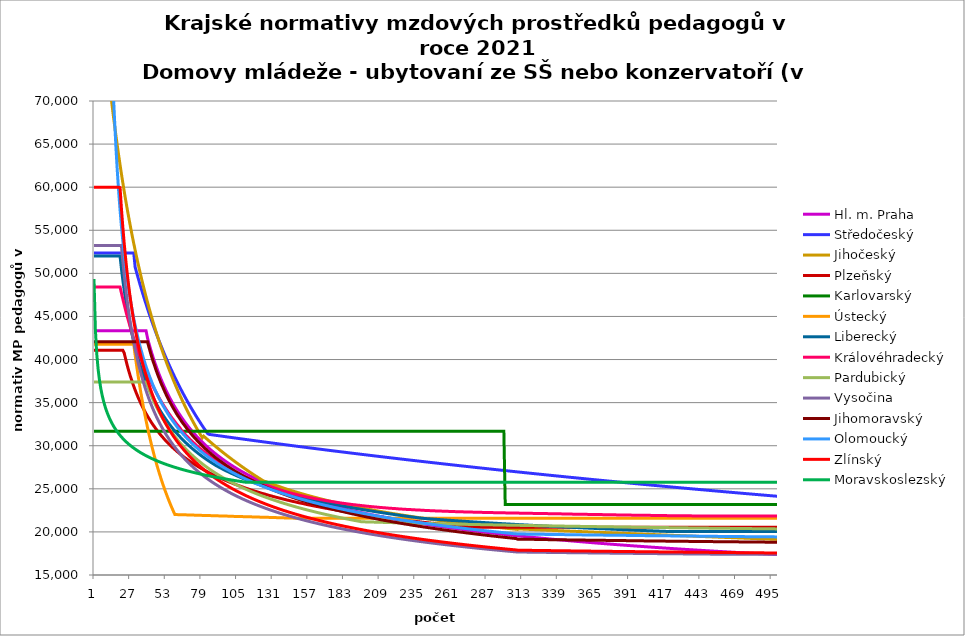
| Category | Hl. m. Praha | Středočeský | Jihočeský | Plzeňský | Karlovarský  | Ústecký   | Liberecký | Královéhradecký | Pardubický | Vysočina | Jihomoravský | Olomoucký | Zlínský | Moravskoslezský |
|---|---|---|---|---|---|---|---|---|---|---|---|---|---|---|
| 0 | 43331.092 | 52360.8 | 92683.42 | 41083 | 31680 | 41765.882 | 52000.645 | 48411.594 | 37400.308 | 53243.175 | 42066.962 | 71223.426 | 60000 | 49347.691 |
| 1 | 43331.092 | 52360.8 | 90397.734 | 41083 | 31680 | 41765.882 | 52000.645 | 48411.594 | 37400.308 | 53243.175 | 42066.962 | 71223.426 | 60000 | 43496.42 |
| 2 | 43331.092 | 52360.8 | 88222.07 | 41083 | 31680 | 41765.882 | 52000.645 | 48411.594 | 37400.308 | 53243.175 | 42066.962 | 71223.426 | 60000 | 40675.174 |
| 3 | 43331.092 | 52360.8 | 86148.671 | 41083 | 31680 | 41765.882 | 52000.645 | 48411.594 | 37400.308 | 53243.175 | 42066.962 | 71223.426 | 60000 | 38885.656 |
| 4 | 43331.092 | 52360.8 | 84170.492 | 41083 | 31680 | 41765.882 | 52000.645 | 48411.594 | 37400.308 | 53243.175 | 42066.962 | 71223.426 | 60000 | 37602.456 |
| 5 | 43331.092 | 52360.8 | 82281.121 | 41083 | 31680 | 41765.882 | 52000.645 | 48411.594 | 37400.308 | 53243.175 | 42066.962 | 71223.426 | 60000 | 36615.221 |
| 6 | 43331.092 | 52360.8 | 80474.71 | 41083 | 31680 | 41765.882 | 52000.645 | 48411.594 | 37400.308 | 53243.175 | 42066.962 | 71223.426 | 60000 | 35820.091 |
| 7 | 43331.092 | 52360.8 | 78745.911 | 41083 | 31680 | 41765.882 | 52000.645 | 48411.594 | 37400.308 | 53243.175 | 42066.962 | 71223.426 | 60000 | 35158.716 |
| 8 | 43331.092 | 52360.8 | 77089.828 | 41083 | 31680 | 41765.882 | 52000.645 | 48411.594 | 37400.308 | 53243.175 | 42066.962 | 71223.426 | 60000 | 34595.29 |
| 9 | 43331.092 | 52360.8 | 75501.967 | 41083 | 31680 | 41765.882 | 52000.645 | 48411.594 | 37400.308 | 53243.175 | 42066.962 | 71223.426 | 60000 | 34106.373 |
| 10 | 43331.092 | 52360.8 | 73978.198 | 41083 | 31680 | 41765.882 | 52000.645 | 48411.594 | 37400.308 | 53243.175 | 42066.962 | 71223.426 | 60000 | 33675.849 |
| 11 | 43331.092 | 52360.8 | 72514.718 | 41083 | 31680 | 41765.882 | 52000.645 | 48411.594 | 37400.308 | 53243.175 | 42066.962 | 71223.426 | 60000 | 33292.193 |
| 12 | 43331.092 | 52360.8 | 71108.017 | 41083 | 31680 | 41765.882 | 52000.645 | 48411.594 | 37400.308 | 53243.175 | 42066.962 | 71223.426 | 60000 | 32946.904 |
| 13 | 43331.092 | 52360.8 | 69754.854 | 41083 | 31680 | 41765.882 | 52000.645 | 48411.594 | 37400.308 | 53243.175 | 42066.962 | 71223.426 | 60000 | 32633.54 |
| 14 | 43331.092 | 52360.8 | 68452.23 | 41083 | 31680 | 41765.882 | 52000.645 | 48411.594 | 37400.308 | 53243.175 | 42066.962 | 71223.426 | 60000 | 32347.117 |
| 15 | 43331.092 | 52360.8 | 67197.365 | 41083 | 31680 | 41765.882 | 52000.645 | 48411.594 | 37400.308 | 53243.175 | 42066.962 | 67846.025 | 60000 | 32083.7 |
| 16 | 43331.092 | 52360.8 | 65987.68 | 41083 | 31680 | 41765.882 | 52000.645 | 48411.594 | 37400.308 | 53243.175 | 42066.962 | 64602.39 | 60000 | 31840.136 |
| 17 | 43331.092 | 52360.8 | 64820.779 | 41083 | 31680 | 41765.882 | 52000.645 | 48411.594 | 37400.308 | 53243.175 | 42066.962 | 61890.076 | 60000 | 31613.861 |
| 18 | 43331.092 | 52360.8 | 63694.43 | 41083 | 31680 | 41765.882 | 52000.645 | 48411.594 | 37400.308 | 53243.175 | 42066.962 | 59468.949 | 60000 | 31402.763 |
| 19 | 43331.092 | 52360.8 | 62606.557 | 41083 | 31680 | 41765.882 | 52000.645 | 48411.594 | 37400.308 | 53243.175 | 42066.962 | 57365.094 | 59952.821 | 31205.085 |
| 20 | 43331.092 | 52360.8 | 61555.221 | 41083 | 31680 | 41765.882 | 50562.156 | 47720 | 37400.308 | 53243.175 | 42066.962 | 55468.187 | 57544.722 | 31019.35 |
| 21 | 43331.092 | 52360.8 | 60538.61 | 41083 | 31680 | 41765.882 | 49262.811 | 47047.887 | 37400.308 | 51457.149 | 42066.962 | 53811.504 | 55422.183 | 30844.304 |
| 22 | 43331.092 | 52360.8 | 59555.034 | 40777.171 | 31680 | 41765.882 | 48082.133 | 46394.444 | 37400.308 | 49851.184 | 42066.962 | 52250.913 | 53535.322 | 30678.876 |
| 23 | 43331.092 | 52360.8 | 58602.908 | 40113.588 | 31680 | 41765.882 | 47003.554 | 45758.904 | 37400.308 | 48407.543 | 42066.962 | 50884.519 | 51845.368 | 30522.145 |
| 24 | 43331.092 | 52360.8 | 57680.746 | 39471.257 | 31680 | 41765.882 | 46013.519 | 45140.541 | 37400.308 | 47102.415 | 42066.962 | 49638.367 | 50321.714 | 30373.309 |
| 25 | 43331.092 | 52360.8 | 56787.156 | 38879.811 | 31680 | 41765.882 | 45100.825 | 44578.292 | 37400.308 | 45907.664 | 42066.962 | 48500.1 | 48939.865 | 30231.673 |
| 26 | 43331.092 | 52360.8 | 55920.831 | 38335.614 | 31680 | 41765.882 | 44256.123 | 44029.877 | 37400.308 | 44819.882 | 42066.962 | 47459.122 | 47679.979 | 30096.625 |
| 27 | 43331.092 | 52360.8 | 55080.542 | 37835.457 | 31680 | 41765.882 | 43471.55 | 43457.069 | 37400.308 | 43812.957 | 42066.962 | 46506.31 | 46525.803 | 29967.625 |
| 28 | 43331.092 | 52360.8 | 54265.132 | 37348.182 | 31680 | 41765.882 | 42740.438 | 42935.733 | 37400.308 | 42886.805 | 42066.962 | 45591.003 | 45463.895 | 29844.196 |
| 29 | 43331.092 | 52360.8 | 53473.512 | 36900.898 | 31680 | 41765.882 | 42057.097 | 42462.712 | 37400.308 | 42027.063 | 42066.962 | 44752.162 | 44483.034 | 29725.914 |
| 30 | 43331.092 | 50737.209 | 52704.657 | 36464.201 | 31680 | 40533.968 | 41416.635 | 41964.824 | 37400.308 | 41231.5 | 42066.962 | 43983.363 | 43573.78 | 29612.399 |
| 31 | 43331.092 | 50154.023 | 51957.597 | 36064.082 | 31680 | 39409.066 | 40814.827 | 41478.477 | 37400.308 | 40488.292 | 42066.962 | 43240.533 | 42728.127 | 29503.312 |
| 32 | 43331.092 | 49584.091 | 51231.42 | 35672.648 | 31680 | 38310.432 | 40247.996 | 41036.855 | 37400.308 | 39790.273 | 42066.962 | 42559.58 | 41939.245 | 29398.345 |
| 33 | 43331.092 | 49026.966 | 50525.262 | 35314.9 | 31680 | 37304.028 | 39712.935 | 40604.538 | 37400.308 | 39134.168 | 42066.962 | 41899.742 | 41201.264 | 29297.224 |
| 34 | 43331.092 | 48482.222 | 49838.306 | 34964.255 | 31680 | 36318.159 | 39206.825 | 40181.235 | 37400.308 | 38522.931 | 42066.962 | 41295.076 | 40509.112 | 29199.698 |
| 35 | 43331.092 | 47949.451 | 49169.779 | 34620.506 | 31680 | 35412.469 | 38727.182 | 39766.667 | 37400.308 | 37944.796 | 42066.962 | 40741.709 | 39858.384 | 29105.54 |
| 36 | 43331.092 | 47428.261 | 48518.951 | 34307.307 | 31680 | 34522.853 | 38271.808 | 39360.566 | 37400.308 | 37400.431 | 42066.962 | 40169.777 | 39245.232 | 29014.542 |
| 37 | 43331.092 | 46918.28 | 47885.126 | 34023.188 | 31680 | 33703.481 | 37838.746 | 38962.675 | 37400.308 | 36879.572 | 42066.962 | 39678.303 | 38666.283 | 28926.516 |
| 38 | 43331.092 | 46419.149 | 47267.648 | 33720.657 | 31680 | 32896.68 | 37426.253 | 38602.465 | 37400.308 | 36388.805 | 42066.962 | 39167.15 | 38118.562 | 28841.289 |
| 39 | 42519.214 | 45930.526 | 46665.892 | 33446.133 | 31680 | 32151.849 | 37032.767 | 38248.855 | 36967.585 | 35926.312 | 42066.962 | 38730.573 | 37599.438 | 28758.702 |
| 40 | 41925.242 | 45452.083 | 46079.264 | 33176.043 | 31680 | 31416.814 | 36656.888 | 37873.016 | 36544.631 | 35482.934 | 41479.127 | 38273.485 | 37106.576 | 28678.608 |
| 41 | 41361.369 | 44983.505 | 45507.203 | 32932.265 | 31680 | 30736.797 | 36297.351 | 37532.584 | 36141.099 | 35062.578 | 40907.494 | 37856.498 | 36637.891 | 28600.873 |
| 42 | 40825.212 | 44524.49 | 44949.171 | 32670.378 | 31680 | 30064.361 | 35953.016 | 37198.218 | 35755.57 | 34659.227 | 40351.402 | 37448.499 | 36191.52 | 28525.373 |
| 43 | 40314.638 | 44074.747 | 44404.659 | 32433.947 | 31680 | 29441.05 | 35622.849 | 36896.907 | 35386.766 | 34276.722 | 39843.624 | 37049.2 | 35765.793 | 28451.993 |
| 44 | 39827.733 | 43634 | 43873.182 | 32221.961 | 31680 | 28823.545 | 35305.911 | 36573.723 | 35033.531 | 33911.707 | 39381.095 | 36685.973 | 35359.204 | 28380.626 |
| 45 | 39362.773 | 43201.98 | 43354.277 | 31991.953 | 31680 | 28250.133 | 35001.347 | 36282.404 | 34694.815 | 33558.861 | 38897.297 | 36329.798 | 34970.396 | 28311.173 |
| 46 | 38918.203 | 42778.431 | 42847.502 | 31785.687 | 31680 | 27681.092 | 34708.378 | 35969.849 | 34369.665 | 33222.053 | 38456.356 | 36007.106 | 34598.138 | 28243.542 |
| 47 | 38492.614 | 42363.107 | 42352.439 | 31582.063 | 31680 | 27151.816 | 34426.288 | 35688.034 | 34057.21 | 32898.392 | 38025.3 | 35663.93 | 34241.315 | 28177.648 |
| 48 | 38084.727 | 41955.769 | 41868.685 | 31381.031 | 31680 | 26625.75 | 34154.425 | 35410.601 | 33756.656 | 32587.306 | 37633.597 | 35352.907 | 33898.913 | 28113.409 |
| 49 | 37693.379 | 41556.19 | 41395.856 | 31182.543 | 31680 | 26135.706 | 33892.187 | 35137.447 | 33467.275 | 32288.263 | 37220.69 | 35047.262 | 33570.006 | 28050.752 |
| 50 | 37317.508 | 41164.151 | 40933.589 | 31006.038 | 31680 | 25647.923 | 33639.02 | 34868.476 | 33188.399 | 32000.763 | 36873.913 | 34746.857 | 33253.748 | 27989.606 |
| 51 | 36956.146 | 40779.439 | 40481.531 | 30812.25 | 31680 | 25192.904 | 33394.416 | 34627.505 | 32919.416 | 31726.338 | 36505.457 | 34475.974 | 32949.364 | 27929.905 |
| 52 | 36608.402 | 40401.852 | 40039.349 | 30639.901 | 31680 | 24739.373 | 33157.904 | 34366.255 | 32659.759 | 31456.58 | 36144.292 | 34209.283 | 32656.145 | 27871.589 |
| 53 | 36273.462 | 40031.193 | 39606.723 | 30469.468 | 31680 | 24315.753 | 32929.046 | 34132.153 | 32408.907 | 31199.107 | 35817.195 | 33946.685 | 32373.436 | 27814.599 |
| 54 | 35950.577 | 39667.273 | 39183.345 | 30319.557 | 31680 | 23892.989 | 32707.44 | 33878.296 | 32166.379 | 30951.526 | 35495.964 | 33688.089 | 32100.636 | 27758.881 |
| 55 | 35639.055 | 39309.91 | 38768.924 | 30152.661 | 31680 | 23497.628 | 32492.711 | 33650.772 | 31931.727 | 30709.717 | 35180.444 | 33433.402 | 31837.188 | 27704.384 |
| 56 | 35338.259 | 38958.929 | 38363.177 | 29987.591 | 31680 | 23102.603 | 32284.51 | 33426.284 | 31704.538 | 30479.04 | 34896.106 | 33205.188 | 31582.58 | 27651.059 |
| 57 | 35047.6 | 38614.159 | 37965.835 | 29842.373 | 31680 | 22732.764 | 32082.513 | 33204.771 | 31484.427 | 30251.804 | 34591.114 | 32980.068 | 31336.336 | 27598.862 |
| 58 | 34766.531 | 38275.439 | 37576.639 | 29698.554 | 31680 | 22362.835 | 31886.417 | 33007.905 | 31271.037 | 30035.1 | 34316.185 | 32757.98 | 31098.015 | 27547.748 |
| 59 | 34494.547 | 37942.609 | 37195.342 | 29556.115 | 31680 | 22016.124 | 31695.94 | 32791.885 | 31064.036 | 29821.479 | 34045.591 | 32538.863 | 30867.208 | 27497.678 |
| 60 | 34231.179 | 37615.517 | 36821.705 | 29415.036 | 31680 | 22016.124 | 31510.818 | 32578.674 | 30863.111 | 29617.848 | 33779.232 | 32322.658 | 30643.533 | 27448.612 |
| 61 | 33975.987 | 37294.017 | 36455.5 | 29275.297 | 31680 | 22004.752 | 31330.804 | 32389.14 | 30667.974 | 29416.978 | 33517.008 | 32109.307 | 30426.635 | 27400.515 |
| 62 | 33728.566 | 36977.966 | 36096.508 | 29154.11 | 31680 | 22004.752 | 31155.667 | 32201.799 | 30478.353 | 29223.907 | 33282.13 | 31919.685 | 30216.185 | 27353.352 |
| 63 | 33488.535 | 36667.227 | 35744.517 | 29016.833 | 31680 | 21993.392 | 30985.19 | 31996.169 | 30293.994 | 29038.379 | 33050.522 | 31732.29 | 30011.873 | 27307.09 |
| 64 | 33255.54 | 36361.667 | 35399.324 | 28897.773 | 31680 | 21993.392 | 30819.169 | 31732.742 | 30114.659 | 28853.538 | 32799.448 | 31547.082 | 29813.409 | 27261.698 |
| 65 | 33029.248 | 36061.157 | 35060.735 | 28762.894 | 31680 | 21982.043 | 30657.412 | 31572.779 | 29940.126 | 28675.938 | 32574.486 | 31364.023 | 29620.524 | 27217.146 |
| 66 | 32809.351 | 35765.574 | 34728.562 | 28645.904 | 31680 | 21982.043 | 30499.738 | 31394.737 | 29770.183 | 28505.354 | 32374.642 | 31183.077 | 29432.964 | 27173.406 |
| 67 | 32595.556 | 35474.797 | 34402.623 | 28529.861 | 31680 | 21982.043 | 30345.979 | 31218.692 | 29604.634 | 28335.192 | 32155.45 | 31004.207 | 29250.492 | 27130.451 |
| 68 | 32387.59 | 35188.71 | 34082.746 | 28414.755 | 31680 | 21970.707 | 30195.974 | 31063.856 | 29443.293 | 28171.781 | 31939.206 | 30827.376 | 29072.882 | 27088.257 |
| 69 | 32185.197 | 34907.2 | 33768.763 | 28300.574 | 31680 | 21970.707 | 30049.571 | 30910.549 | 29285.986 | 28013.362 | 31747.059 | 30671.879 | 28899.927 | 27046.797 |
| 70 | 31988.136 | 34630.159 | 33460.512 | 28187.307 | 31680 | 21959.381 | 29906.627 | 30739.877 | 29132.546 | 27856.716 | 31557.209 | 30517.942 | 28731.427 | 27006.05 |
| 71 | 31796.179 | 34357.48 | 33157.837 | 28090.94 | 31680 | 21959.381 | 29767.009 | 30589.744 | 28982.819 | 27706.388 | 31348.911 | 30346.6 | 28567.197 | 26965.992 |
| 72 | 31609.114 | 34089.062 | 32860.589 | 27979.342 | 31680 | 21948.068 | 29630.587 | 30441.069 | 28836.657 | 27557.673 | 31163.78 | 30195.903 | 28407.061 | 26926.604 |
| 73 | 31426.737 | 33824.806 | 32568.624 | 27868.626 | 31680 | 21948.068 | 29497.241 | 30293.833 | 28693.92 | 27413.534 | 30980.822 | 30046.695 | 28250.853 | 26887.863 |
| 74 | 31248.859 | 33564.615 | 32281.8 | 27774.423 | 31680 | 21936.766 | 29366.855 | 30148.014 | 28554.478 | 27272.372 | 30819.987 | 29898.955 | 28098.416 | 26849.752 |
| 75 | 31075.301 | 33308.397 | 31999.985 | 27680.853 | 31680 | 21936.766 | 29239.322 | 30003.593 | 28418.205 | 27134.121 | 30641.032 | 29770.869 | 27949.602 | 26812.252 |
| 76 | 30905.89 | 33056.061 | 31723.048 | 27572.483 | 31680 | 21936.766 | 29114.537 | 29860.548 | 28284.982 | 26998.712 | 30464.144 | 29625.822 | 27804.271 | 26775.344 |
| 77 | 30740.468 | 32807.519 | 31450.862 | 27480.268 | 31680 | 21925.476 | 28992.402 | 29736.499 | 28154.698 | 26868.952 | 30308.615 | 29482.182 | 27662.289 | 26739.012 |
| 78 | 30578.881 | 32562.687 | 31183.308 | 27388.667 | 31680 | 21925.476 | 28872.825 | 29595.983 | 28027.245 | 26739.013 | 30154.667 | 29357.634 | 27523.532 | 26703.24 |
| 79 | 30420.985 | 32321.481 | 30920.268 | 27297.674 | 31680 | 21914.198 | 28755.715 | 29474.118 | 27902.523 | 26614.546 | 29983.333 | 29216.577 | 27387.88 | 26668.011 |
| 80 | 30266.643 | 32083.824 | 31113.726 | 27207.285 | 31680 | 21914.198 | 28640.99 | 29336.066 | 27780.435 | 26491.234 | 29832.663 | 29094.258 | 27255.218 | 26633.311 |
| 81 | 30115.724 | 31849.635 | 30971.326 | 27117.492 | 31680 | 21902.931 | 28528.566 | 29216.327 | 27660.889 | 26370.44 | 29683.5 | 28972.96 | 27125.44 | 26599.125 |
| 82 | 29968.105 | 31618.841 | 30830.223 | 27043.116 | 31680 | 21902.931 | 28418.369 | 29080.673 | 27543.799 | 26252.113 | 29535.821 | 28852.669 | 26998.443 | 26565.44 |
| 83 | 29823.669 | 31391.367 | 30690.401 | 26954.401 | 31680 | 21902.931 | 28310.325 | 28963.006 | 27429.08 | 26137.558 | 29389.604 | 28733.373 | 26874.13 | 26532.242 |
| 84 | 29682.303 | 31316.268 | 30551.84 | 26866.267 | 31680 | 21891.675 | 28204.363 | 28846.287 | 27316.654 | 26023.999 | 29262.847 | 28615.059 | 26752.407 | 26499.518 |
| 85 | 29543.901 | 31293.808 | 30414.526 | 26793.261 | 31680 | 21891.675 | 28100.417 | 28730.505 | 27206.444 | 25912.757 | 29119.313 | 28497.715 | 26633.186 | 26467.256 |
| 86 | 29408.362 | 31271.381 | 30278.44 | 26706.176 | 31680 | 21880.431 | 27998.423 | 28615.648 | 27098.379 | 25805.108 | 28977.181 | 28381.33 | 26516.383 | 26435.444 |
| 87 | 29275.588 | 31248.985 | 30143.566 | 26634.036 | 31680 | 21880.431 | 27898.32 | 28501.706 | 26992.39 | 25699.663 | 28853.949 | 28265.892 | 26401.918 | 26404.071 |
| 88 | 29145.489 | 31226.622 | 30009.889 | 26547.981 | 31680 | 21869.199 | 27800.049 | 28388.669 | 26888.41 | 25593.774 | 28714.389 | 28167.69 | 26289.714 | 26373.125 |
| 89 | 29017.975 | 31204.291 | 29877.392 | 26476.692 | 31680 | 21869.199 | 27703.554 | 28292.49 | 26786.377 | 25491.337 | 28593.377 | 28053.979 | 26179.697 | 26342.597 |
| 90 | 28892.962 | 31181.991 | 29746.06 | 26391.649 | 31680 | 21869.199 | 27615.404 | 28181.102 | 26686.23 | 25390.997 | 28473.381 | 27941.183 | 26071.798 | 26312.475 |
| 91 | 28770.371 | 31159.724 | 29615.877 | 26321.196 | 31680 | 21857.978 | 27528.768 | 28070.588 | 26587.912 | 25292.716 | 28354.388 | 27845.22 | 25965.949 | 26282.75 |
| 92 | 28650.125 | 31137.488 | 29486.829 | 26251.118 | 31680 | 21857.978 | 27443.601 | 27976.549 | 26491.366 | 25195.193 | 28236.385 | 27749.914 | 25862.087 | 26253.412 |
| 93 | 28532.15 | 31115.284 | 29358.901 | 26181.413 | 31680 | 21846.769 | 27359.862 | 27867.631 | 26396.541 | 25099.671 | 28119.361 | 27639.545 | 25760.15 | 26224.453 |
| 94 | 28416.375 | 31093.112 | 29232.078 | 26112.076 | 31680 | 21846.769 | 27277.51 | 27774.945 | 26303.385 | 25008.599 | 28003.302 | 27545.64 | 25660.08 | 26195.863 |
| 95 | 28302.734 | 31070.971 | 29106.345 | 26043.106 | 31680 | 21835.572 | 27196.508 | 27667.587 | 26211.849 | 24915.718 | 27888.197 | 27452.37 | 25561.82 | 26167.633 |
| 96 | 28191.162 | 31048.861 | 28981.69 | 25974.499 | 31680 | 21835.572 | 27116.817 | 27576.225 | 26121.887 | 24825.973 | 27774.035 | 27359.73 | 25465.316 | 26139.756 |
| 97 | 28081.597 | 31026.784 | 28858.098 | 25906.253 | 31680 | 21835.572 | 27038.402 | 27485.464 | 26033.454 | 24736.873 | 27660.804 | 27267.713 | 25370.517 | 26112.224 |
| 98 | 27973.98 | 31004.737 | 28735.556 | 25838.365 | 31680 | 21824.385 | 26961.228 | 27395.298 | 25946.506 | 24649.618 | 27564.481 | 27176.313 | 25277.373 | 26085.028 |
| 99 | 27868.253 | 30982.722 | 28614.05 | 25770.831 | 31680 | 21824.385 | 26885.263 | 27305.722 | 25861.002 | 24564.175 | 27452.948 | 27085.523 | 25185.836 | 26058.161 |
| 100 | 27764.364 | 30960.738 | 28493.567 | 25717.058 | 31680 | 21813.21 | 26810.474 | 27216.73 | 25776.902 | 24479.323 | 27342.314 | 26995.339 | 25095.861 | 26031.615 |
| 101 | 27662.258 | 30938.785 | 28374.095 | 25650.156 | 31680 | 21813.21 | 26736.831 | 27128.316 | 25694.168 | 24397.42 | 27248.193 | 26905.752 | 25007.403 | 26005.385 |
| 102 | 27561.886 | 30916.863 | 28255.62 | 25583.601 | 31680 | 21802.047 | 26664.304 | 27040.475 | 25612.763 | 24314.889 | 27154.717 | 26831.55 | 24920.421 | 25979.462 |
| 103 | 27463.198 | 30894.973 | 28138.131 | 25530.606 | 31680 | 21802.047 | 26592.865 | 26953.201 | 25532.652 | 24236.416 | 27046.469 | 26743.046 | 24834.874 | 25953.841 |
| 104 | 27366.15 | 30873.113 | 28021.614 | 25464.669 | 31680 | 21790.895 | 26522.485 | 26866.488 | 25453.799 | 24157.288 | 26954.37 | 26655.123 | 24750.722 | 25928.515 |
| 105 | 27270.695 | 30851.284 | 27906.059 | 25399.073 | 31680 | 21790.895 | 26453.139 | 26794.652 | 25376.172 | 24079.828 | 26862.896 | 26582.295 | 24667.928 | 25903.477 |
| 106 | 27176.79 | 30829.487 | 27791.452 | 25346.838 | 31680 | 21790.895 | 26384.801 | 26708.955 | 25299.74 | 24005.153 | 26772.041 | 26495.425 | 24586.456 | 25878.723 |
| 107 | 27084.395 | 30807.719 | 27677.784 | 25294.818 | 31680 | 21779.755 | 26317.445 | 26637.959 | 25224.472 | 23928.663 | 26666.816 | 26423.466 | 24506.271 | 25854.245 |
| 108 | 26993.469 | 30785.983 | 27565.041 | 25230.092 | 31680 | 21779.755 | 26251.049 | 26553.259 | 25150.337 | 23853.79 | 26577.28 | 26337.629 | 24427.338 | 25830.038 |
| 109 | 26903.973 | 30764.277 | 27453.213 | 25178.55 | 31680 | 21768.625 | 26185.589 | 26483.087 | 25077.308 | 23781.633 | 26488.344 | 26266.523 | 24349.627 | 25806.097 |
| 110 | 26815.871 | 30742.602 | 27342.288 | 25114.417 | 31680 | 21768.625 | 26121.042 | 26399.368 | 25005.358 | 23709.91 | 26400 | 26181.701 | 24273.105 | 25782.417 |
| 111 | 26729.126 | 30720.958 | 27232.257 | 25063.345 | 31680 | 21757.508 | 26057.388 | 26330.005 | 24934.458 | 23639.729 | 26326.829 | 26111.433 | 24197.743 | 25758.991 |
| 112 | 26643.705 | 30699.343 | 27123.107 | 25012.481 | 31680 | 21757.508 | 25994.604 | 26261.006 | 24864.585 | 23571.067 | 26239.558 | 26041.542 | 24123.511 | 25757.576 |
| 113 | 26559.573 | 30677.76 | 27014.829 | 24961.823 | 31680 | 21757.508 | 25932.672 | 26192.368 | 24795.712 | 23501.705 | 26152.863 | 25972.023 | 24050.381 | 25757.576 |
| 114 | 26476.699 | 30656.206 | 26907.412 | 24898.788 | 31680 | 21746.401 | 25871.571 | 26124.088 | 24727.817 | 23433.841 | 26066.74 | 25902.875 | 23978.325 | 25757.576 |
| 115 | 26395.051 | 30634.683 | 26800.846 | 24848.589 | 31680 | 21746.401 | 25811.283 | 26056.162 | 24660.875 | 23367.453 | 25995.402 | 25834.095 | 23907.319 | 25757.576 |
| 116 | 26314.599 | 30613.19 | 26695.121 | 24798.592 | 31680 | 21735.306 | 25751.789 | 25988.589 | 24594.865 | 23302.519 | 25910.311 | 25752.038 | 23837.336 | 25757.576 |
| 117 | 26235.315 | 30591.727 | 26590.226 | 24748.795 | 31680 | 21735.306 | 25693.071 | 25921.366 | 24529.765 | 23236.872 | 25825.775 | 25684.055 | 23768.352 | 25757.576 |
| 118 | 26157.171 | 30570.294 | 26486.153 | 24699.198 | 31680 | 21724.222 | 25635.113 | 25854.489 | 24465.553 | 23173.729 | 25755.748 | 25616.43 | 23700.343 | 25757.576 |
| 119 | 26080.138 | 30548.891 | 26382.891 | 24649.8 | 31680 | 21724.222 | 25577.897 | 25787.957 | 24402.21 | 23109.866 | 25672.216 | 25562.585 | 23633.287 | 25757.576 |
| 120 | 26004.192 | 30527.519 | 26280.431 | 24600.599 | 31680 | 21724.222 | 25521.408 | 25721.766 | 24339.716 | 23048.465 | 25603.019 | 25495.597 | 23567.161 | 25757.576 |
| 121 | 25929.306 | 30506.176 | 26178.764 | 24551.594 | 31680 | 21713.15 | 25465.63 | 25655.914 | 24278.051 | 22986.34 | 25534.194 | 25428.96 | 23501.943 | 25757.576 |
| 122 | 25855.457 | 30484.863 | 26077.881 | 24502.783 | 31680 | 21713.15 | 25410.547 | 25603.475 | 24217.198 | 22926.638 | 25452.09 | 25362.669 | 23437.614 | 25757.576 |
| 123 | 25782.62 | 30463.579 | 25977.772 | 24454.167 | 31680 | 21702.089 | 25356.145 | 25538.226 | 24157.138 | 22867.245 | 25384.073 | 25296.724 | 23374.152 | 25757.576 |
| 124 | 25710.772 | 30442.326 | 25878.428 | 24417.831 | 31680 | 21702.089 | 25302.41 | 25486.267 | 24097.854 | 22808.16 | 25316.418 | 25244.214 | 23311.539 | 25757.576 |
| 125 | 25639.892 | 30421.102 | 25858.002 | 24369.55 | 31680 | 21691.039 | 25249.328 | 25421.613 | 24039.329 | 22749.378 | 25235.707 | 25178.882 | 23249.755 | 25757.576 |
| 126 | 25569.956 | 30399.907 | 25795.848 | 24321.46 | 31680 | 21691.039 | 25196.885 | 25370.127 | 23981.547 | 22691.923 | 25168.839 | 25113.887 | 23188.782 | 25757.576 |
| 127 | 25500.946 | 30378.742 | 25734.477 | 24273.56 | 31680 | 21691.039 | 25145.068 | 25306.061 | 23924.492 | 22635.775 | 25102.326 | 25062.133 | 23128.603 | 25757.576 |
| 128 | 25432.839 | 30357.607 | 25673.871 | 24225.848 | 31680 | 21680 | 25093.864 | 25255.04 | 23868.149 | 22579.904 | 25036.162 | 24997.739 | 23069.2 | 25757.576 |
| 129 | 25365.617 | 30336.501 | 25614.015 | 24190.186 | 31680 | 21680 | 25043.262 | 25204.225 | 23812.503 | 22525.317 | 24970.347 | 24933.675 | 23010.557 | 25757.576 |
| 130 | 25299.261 | 30315.424 | 25554.893 | 24142.801 | 31680 | 21668.973 | 24993.248 | 25153.614 | 23757.539 | 22469.989 | 24904.877 | 24882.66 | 22952.657 | 25757.576 |
| 131 | 25233.752 | 30294.376 | 25496.489 | 24095.601 | 31680 | 21668.973 | 24943.813 | 25103.206 | 23703.243 | 22416.93 | 24839.749 | 24819.184 | 22895.485 | 25757.576 |
| 132 | 25169.071 | 30273.358 | 25438.79 | 24060.322 | 31680 | 21657.956 | 24894.943 | 25040.48 | 23649.602 | 22363.127 | 24774.961 | 24768.635 | 22839.025 | 25757.576 |
| 133 | 25105.202 | 30252.369 | 25381.78 | 24013.444 | 31680 | 21657.956 | 24846.628 | 24990.524 | 23596.602 | 22310.571 | 24710.51 | 24718.293 | 22783.262 | 25757.576 |
| 134 | 25042.128 | 30231.409 | 25325.447 | 23978.405 | 31680 | 21646.951 | 24798.858 | 24940.767 | 23544.23 | 22258.261 | 24646.393 | 24655.651 | 22728.183 | 25757.576 |
| 135 | 24979.832 | 30210.478 | 25269.776 | 23931.845 | 31680 | 21646.951 | 24751.621 | 24891.207 | 23492.475 | 22207.177 | 24582.609 | 24605.766 | 22673.773 | 25757.576 |
| 136 | 24918.298 | 30189.576 | 25214.754 | 23897.043 | 31680 | 21646.951 | 24704.908 | 24854.167 | 23441.323 | 22156.326 | 24519.153 | 24556.083 | 22620.019 | 25757.576 |
| 137 | 24857.51 | 30168.702 | 25160.369 | 23850.798 | 31680 | 21635.957 | 24658.709 | 24804.95 | 23390.763 | 22106.678 | 24468.624 | 24494.26 | 22566.907 | 25757.576 |
| 138 | 24797.455 | 30147.858 | 25106.609 | 23816.232 | 31680 | 21635.957 | 24613.014 | 24755.929 | 23340.783 | 22058.22 | 24405.755 | 24445.025 | 22514.425 | 25757.576 |
| 139 | 24738.116 | 30127.043 | 25053.46 | 23770.299 | 31680 | 21624.975 | 24567.814 | 24707.101 | 23291.373 | 22009.011 | 24343.209 | 24395.988 | 22462.56 | 25757.576 |
| 140 | 24679.48 | 30106.256 | 25000.912 | 23735.965 | 31680 | 21624.975 | 24523.1 | 24658.465 | 23242.521 | 21960.979 | 24293.402 | 24347.147 | 22411.3 | 25757.576 |
| 141 | 24621.532 | 30085.498 | 24948.953 | 23690.341 | 31680 | 21614.003 | 24478.862 | 24622.113 | 23194.216 | 21913.157 | 24231.429 | 24286.37 | 22360.633 | 25757.576 |
| 142 | 24564.26 | 30064.768 | 24897.572 | 23656.238 | 31680 | 21614.003 | 24435.093 | 24573.811 | 23146.449 | 21865.543 | 24169.771 | 24237.967 | 22310.548 | 25757.576 |
| 143 | 24507.65 | 30044.067 | 24846.758 | 23622.233 | 31680 | 21614.003 | 24391.783 | 24537.708 | 23099.208 | 21819.081 | 24120.67 | 24189.756 | 22261.034 | 25757.576 |
| 144 | 24451.689 | 30023.394 | 24796.5 | 23577.044 | 31680 | 21603.043 | 24348.924 | 24489.736 | 23052.486 | 21772.816 | 24059.574 | 24141.737 | 22212.079 | 25757.576 |
| 145 | 24396.366 | 30002.75 | 24746.789 | 23543.266 | 31680 | 21603.043 | 24306.509 | 24453.88 | 23006.271 | 21727.685 | 24010.92 | 24093.908 | 22163.673 | 25757.576 |
| 146 | 24341.667 | 29982.135 | 24697.614 | 23509.585 | 31680 | 21592.093 | 24264.529 | 24406.235 | 22960.554 | 21681.806 | 23950.378 | 24046.268 | 22115.806 | 25757.576 |
| 147 | 24287.581 | 29961.547 | 24648.965 | 23476 | 31680 | 21592.093 | 24222.978 | 24370.623 | 22915.327 | 21637.052 | 23902.164 | 23998.816 | 22068.468 | 25757.576 |
| 148 | 24234.097 | 29940.988 | 24600.833 | 23431.369 | 31680 | 21581.155 | 24181.846 | 24335.114 | 22870.58 | 21592.481 | 23842.169 | 23951.551 | 22021.649 | 25757.576 |
| 149 | 24181.204 | 29920.457 | 24553.209 | 23398.007 | 31680 | 21581.155 | 24141.128 | 24287.93 | 22826.306 | 21549.017 | 23794.389 | 23904.472 | 21975.339 | 25757.576 |
| 150 | 24128.89 | 29899.954 | 24506.084 | 23364.739 | 31680 | 21581.155 | 24100.816 | 24252.662 | 22782.495 | 21505.727 | 23746.8 | 23857.577 | 21929.53 | 25757.576 |
| 151 | 24077.145 | 29879.48 | 24459.448 | 23331.566 | 31680 | 21581.155 | 24060.903 | 24217.496 | 22739.139 | 21461.696 | 23687.581 | 23810.866 | 21884.211 | 25757.576 |
| 152 | 24025.958 | 29859.033 | 24413.294 | 23298.488 | 31680 | 21581.155 | 24021.383 | 24182.432 | 22696.231 | 21419.668 | 23640.418 | 23764.338 | 21839.375 | 25757.576 |
| 153 | 23975.32 | 29838.614 | 24367.612 | 23265.503 | 31680 | 21581.155 | 23982.248 | 24147.47 | 22653.762 | 21378.713 | 23593.443 | 23729.561 | 21795.012 | 25757.576 |
| 154 | 23925.221 | 29818.223 | 24322.396 | 23232.611 | 31680 | 21581.155 | 23943.493 | 24101.01 | 22611.726 | 21336.104 | 23546.653 | 23683.35 | 21751.115 | 25757.576 |
| 155 | 23875.651 | 29797.86 | 24277.635 | 23188.899 | 31680 | 21581.155 | 23905.111 | 24066.282 | 22570.114 | 21295.467 | 23488.427 | 23637.318 | 21707.674 | 25757.576 |
| 156 | 23826.601 | 29777.525 | 24233.324 | 23156.224 | 31680 | 21581.155 | 23867.096 | 24031.655 | 22528.919 | 21254.985 | 23442.053 | 23591.465 | 21664.683 | 25757.576 |
| 157 | 23778.061 | 29757.218 | 24189.454 | 23123.64 | 31680 | 21581.155 | 23829.441 | 24008.625 | 22488.135 | 21215.551 | 23395.862 | 23557.191 | 21622.133 | 25757.576 |
| 158 | 23730.023 | 29736.938 | 24146.018 | 23091.148 | 31680 | 21581.155 | 23792.142 | 23974.163 | 22447.753 | 21175.371 | 23349.853 | 23511.648 | 21580.017 | 25757.576 |
| 159 | 23682.478 | 29716.686 | 24103.008 | 23058.746 | 31680 | 21581.155 | 23755.192 | 23939.799 | 22407.769 | 21136.232 | 23304.024 | 23466.281 | 21538.327 | 25757.576 |
| 160 | 23635.418 | 29696.461 | 24060.418 | 23026.436 | 31680 | 21581.155 | 23718.586 | 23905.534 | 22368.174 | 21097.237 | 23258.374 | 23421.088 | 21497.056 | 25757.576 |
| 161 | 23588.834 | 29676.264 | 24018.241 | 22994.216 | 31680 | 21581.155 | 23682.318 | 23871.367 | 22328.963 | 21059.267 | 23212.903 | 23387.308 | 21456.197 | 25757.576 |
| 162 | 23542.718 | 29656.094 | 23976.469 | 22962.087 | 31680 | 21581.155 | 23646.383 | 23837.298 | 22290.129 | 21019.677 | 23167.61 | 23342.418 | 21415.743 | 25757.576 |
| 163 | 23497.063 | 29635.952 | 23935.096 | 22940.717 | 31680 | 21581.155 | 23610.776 | 23814.639 | 22251.667 | 20981.11 | 23122.493 | 23308.864 | 21375.688 | 25757.576 |
| 164 | 23451.86 | 29615.837 | 23894.117 | 22908.736 | 31680 | 21581.155 | 23575.491 | 23780.731 | 22213.569 | 20943.556 | 23077.551 | 23264.275 | 21336.024 | 25757.576 |
| 165 | 23407.102 | 29595.749 | 23853.523 | 22876.845 | 31680 | 21581.155 | 23540.524 | 23746.919 | 22175.831 | 20907.875 | 23032.784 | 23219.857 | 21296.745 | 25757.576 |
| 166 | 23362.783 | 29575.689 | 23813.31 | 22845.042 | 31680 | 21581.155 | 23505.87 | 23724.432 | 22138.446 | 20870.582 | 22988.19 | 23186.654 | 21257.845 | 25757.576 |
| 167 | 23318.894 | 29555.656 | 23773.472 | 22813.327 | 31680 | 21581.155 | 23471.523 | 23690.78 | 22101.409 | 20834.286 | 22943.768 | 23142.531 | 21219.319 | 25757.576 |
| 168 | 23275.428 | 29535.65 | 23734.001 | 22781.701 | 31680 | 21581.155 | 23437.48 | 23668.399 | 22064.715 | 20798.115 | 22899.518 | 23109.549 | 21181.158 | 25757.576 |
| 169 | 23232.379 | 29515.671 | 23694.893 | 22750.162 | 31680 | 21581.155 | 23403.735 | 23634.906 | 22028.357 | 20762.07 | 22855.438 | 23065.718 | 21143.359 | 25757.576 |
| 170 | 23189.741 | 29495.719 | 23656.142 | 22729.184 | 31680 | 21581.155 | 23370.284 | 23612.63 | 21992.332 | 20726.149 | 22811.527 | 23032.955 | 21105.915 | 25757.576 |
| 171 | 23147.505 | 29475.794 | 23617.742 | 22697.79 | 31680 | 21581.155 | 23337.123 | 23579.294 | 21956.633 | 20691.204 | 22767.785 | 23000.284 | 21068.821 | 25757.576 |
| 172 | 23105.667 | 29455.896 | 23579.689 | 22666.483 | 31680 | 21581.155 | 23304.247 | 23557.123 | 21921.255 | 20656.376 | 22724.211 | 22956.866 | 21032.071 | 25757.576 |
| 173 | 23064.22 | 29436.024 | 23541.976 | 22635.262 | 31680 | 21581.155 | 23271.653 | 23534.993 | 21886.195 | 20622.51 | 22691.639 | 22924.411 | 20995.659 | 25757.576 |
| 174 | 23023.157 | 29416.18 | 23504.598 | 22604.127 | 31680 | 21581.155 | 23239.335 | 23501.876 | 21851.446 | 20587.913 | 22648.355 | 22881.279 | 20959.581 | 25757.576 |
| 175 | 22982.473 | 29396.362 | 23467.551 | 22583.417 | 31680 | 21581.155 | 23207.291 | 23479.85 | 21817.005 | 20554.271 | 22605.236 | 22849.037 | 20923.831 | 25757.576 |
| 176 | 22942.162 | 29376.571 | 23430.83 | 22552.425 | 31680 | 21581.155 | 23175.516 | 23457.865 | 21782.866 | 20519.902 | 22562.28 | 22816.886 | 20888.404 | 25757.576 |
| 177 | 22902.218 | 29356.806 | 23394.429 | 22521.517 | 31680 | 21581.155 | 23144.005 | 23435.921 | 21749.026 | 20487.316 | 22530.171 | 22774.157 | 20853.296 | 25757.576 |
| 178 | 22862.635 | 29337.069 | 23358.344 | 22500.958 | 31680 | 21581.155 | 23112.757 | 23403.083 | 21715.479 | 20454.002 | 22487.5 | 22742.216 | 20818.501 | 25757.576 |
| 179 | 22823.409 | 29317.357 | 23322.571 | 22470.191 | 31680 | 21581.155 | 23081.766 | 23381.241 | 21682.221 | 20421.625 | 22444.991 | 22710.364 | 20784.015 | 25757.576 |
| 180 | 22784.533 | 29297.672 | 23287.104 | 22439.508 | 31680 | 21581.155 | 23051.028 | 23359.441 | 21649.249 | 20389.35 | 22413.214 | 22678.601 | 20749.834 | 25757.576 |
| 181 | 22746.002 | 29278.014 | 23251.939 | 22419.1 | 31680 | 21581.155 | 23020.542 | 23337.68 | 21616.557 | 20356.354 | 22370.984 | 22636.389 | 20715.951 | 25757.576 |
| 182 | 22707.811 | 29258.382 | 23217.072 | 22388.556 | 31680 | 21581.155 | 22990.302 | 23315.961 | 21584.143 | 20325.106 | 22339.417 | 22604.833 | 20682.364 | 25757.576 |
| 183 | 22669.956 | 29238.776 | 23182.499 | 22358.095 | 31680 | 21581.155 | 22960.306 | 23294.282 | 21552.001 | 20293.135 | 22297.465 | 22573.364 | 20649.068 | 25757.576 |
| 184 | 22632.43 | 29219.196 | 23148.215 | 22337.834 | 31680 | 21581.155 | 22930.549 | 23272.643 | 21520.128 | 20262.081 | 22255.67 | 22541.983 | 20616.059 | 25757.576 |
| 185 | 22595.23 | 29199.643 | 23114.216 | 22307.511 | 31680 | 21581.155 | 22901.03 | 23251.044 | 21488.521 | 20231.935 | 22224.427 | 22500.278 | 20583.332 | 25757.576 |
| 186 | 22558.351 | 29180.116 | 23080.499 | 22287.342 | 31680 | 21581.155 | 22871.744 | 23229.485 | 21457.175 | 20199.446 | 22182.905 | 22469.099 | 20550.884 | 25757.576 |
| 187 | 22521.788 | 29160.615 | 23047.059 | 22257.156 | 31680 | 21581.155 | 22842.689 | 23207.967 | 21426.087 | 20169.486 | 22151.866 | 22438.007 | 20518.709 | 25757.576 |
| 188 | 22485.535 | 29141.14 | 23013.892 | 22237.077 | 31680 | 21581.155 | 22813.861 | 23186.488 | 21395.253 | 20139.615 | 22110.615 | 22407.001 | 20486.806 | 25757.576 |
| 189 | 22449.59 | 29121.691 | 22980.995 | 22207.027 | 31680 | 21581.155 | 22785.257 | 23165.049 | 21364.669 | 20109.832 | 22079.777 | 22376.081 | 20455.169 | 25757.576 |
| 190 | 22413.947 | 29102.268 | 22948.364 | 22187.039 | 31680 | 21581.155 | 22756.874 | 23154.344 | 21334.333 | 20080.137 | 22049.025 | 22345.246 | 20423.795 | 25757.576 |
| 191 | 22378.603 | 29082.87 | 22915.995 | 22157.124 | 31680 | 21581.155 | 22728.71 | 23132.964 | 21304.241 | 20049.731 | 22008.156 | 22314.495 | 20392.68 | 25757.576 |
| 192 | 22343.553 | 29063.499 | 22883.884 | 22137.225 | 31680 | 21581.155 | 22700.761 | 23111.624 | 21274.388 | 20021.01 | 21977.603 | 22283.83 | 20361.82 | 25757.576 |
| 193 | 22308.792 | 29044.154 | 22852.029 | 22107.444 | 31680 | 21581.155 | 22673.025 | 23090.323 | 21244.774 | 19991.577 | 21936.998 | 22253.248 | 20331.213 | 25757.576 |
| 194 | 22274.317 | 29024.834 | 22820.425 | 22087.634 | 31680 | 21581.155 | 22645.498 | 23079.687 | 21215.393 | 19963.022 | 21906.642 | 22222.75 | 20300.854 | 25757.576 |
| 195 | 22240.125 | 29005.54 | 22789.07 | 22057.987 | 31680 | 21581.155 | 22618.179 | 23058.445 | 21177.871 | 19934.548 | 21876.37 | 22192.336 | 20270.74 | 25757.576 |
| 196 | 22206.21 | 28986.271 | 22757.959 | 22038.266 | 31680 | 21581.155 | 22591.063 | 23037.241 | 21173.178 | 19906.156 | 21836.138 | 22162.005 | 20240.868 | 25757.576 |
| 197 | 22172.57 | 28967.028 | 22727.09 | 22008.75 | 31680 | 21581.155 | 22564.15 | 23026.654 | 21168.51 | 19878.63 | 21806.061 | 22131.756 | 20211.235 | 25757.576 |
| 198 | 22139.2 | 28947.811 | 22696.46 | 21989.117 | 31680 | 21581.155 | 22537.436 | 23005.51 | 21163.868 | 19850.396 | 21776.066 | 22101.59 | 20181.836 | 25757.576 |
| 199 | 22106.096 | 28928.619 | 22666.065 | 21969.519 | 31680 | 21581.155 | 22510.918 | 22984.404 | 21159.252 | 19822.243 | 21736.201 | 22071.506 | 20152.67 | 25757.576 |
| 200 | 22073.256 | 28909.452 | 22635.903 | 21940.187 | 31680 | 21581.155 | 22484.594 | 22973.865 | 21154.66 | 19794.948 | 21706.399 | 22041.504 | 20123.733 | 25757.576 |
| 201 | 22040.676 | 28890.311 | 22605.97 | 21920.676 | 31680 | 21581.155 | 22458.462 | 22952.817 | 21150.093 | 19766.952 | 21676.677 | 22011.584 | 20095.022 | 25757.576 |
| 202 | 22008.352 | 28871.195 | 22576.263 | 21891.474 | 31680 | 21581.155 | 22432.52 | 22942.308 | 21145.551 | 19740.584 | 21647.037 | 21981.744 | 20066.534 | 25757.576 |
| 203 | 21976.281 | 28852.105 | 22546.779 | 21872.05 | 31680 | 21581.155 | 22406.764 | 22921.317 | 21141.032 | 19713.513 | 21607.643 | 21951.986 | 20038.266 | 25757.576 |
| 204 | 21944.459 | 28833.04 | 22517.516 | 21852.66 | 31680 | 21581.155 | 22381.193 | 22910.837 | 21136.538 | 19687.287 | 21578.192 | 21922.307 | 20010.215 | 25757.576 |
| 205 | 21912.883 | 28814 | 22488.47 | 21823.639 | 31680 | 21581.155 | 22355.804 | 22889.904 | 21132.068 | 19660.363 | 21548.82 | 21892.709 | 19982.379 | 25757.576 |
| 206 | 21881.551 | 28794.985 | 22459.64 | 21804.334 | 31680 | 21581.155 | 22330.595 | 22879.452 | 21127.621 | 19634.278 | 21519.529 | 21863.191 | 19954.754 | 25757.576 |
| 207 | 21850.458 | 28775.995 | 22431.022 | 21785.064 | 31680 | 21581.155 | 22305.564 | 22869.01 | 21123.197 | 19608.262 | 21490.317 | 21843.556 | 19927.338 | 25757.576 |
| 208 | 21819.602 | 28757.03 | 22402.613 | 21756.222 | 31680 | 21581.155 | 22280.709 | 22848.153 | 21118.797 | 19581.553 | 21451.491 | 21814.17 | 19900.128 | 25757.576 |
| 209 | 21788.98 | 28738.09 | 22374.411 | 21737.037 | 31680 | 21581.155 | 22256.028 | 22837.739 | 21114.419 | 19556.437 | 21422.463 | 21784.863 | 19873.121 | 25757.576 |
| 210 | 21758.588 | 28719.175 | 22346.414 | 21717.885 | 31680 | 21581.155 | 22231.517 | 22827.335 | 21110.064 | 19531.385 | 21393.514 | 21755.635 | 19846.316 | 25757.576 |
| 211 | 21728.424 | 28700.285 | 22318.619 | 21698.768 | 31680 | 21581.155 | 22207.177 | 22806.554 | 21105.731 | 19505.641 | 21364.642 | 21726.485 | 19819.709 | 25757.576 |
| 212 | 21698.485 | 28681.42 | 22291.023 | 21670.154 | 31680 | 21581.155 | 22183.004 | 22796.178 | 21101.421 | 19480.719 | 21335.849 | 21707.095 | 19793.298 | 25757.576 |
| 213 | 21668.768 | 28662.579 | 22263.624 | 21651.12 | 31680 | 21581.155 | 22158.996 | 22785.812 | 21097.132 | 19455.86 | 21307.133 | 21678.075 | 19767.081 | 25757.576 |
| 214 | 21639.271 | 28643.764 | 22236.419 | 21632.119 | 31680 | 21581.155 | 22135.151 | 22775.455 | 21092.865 | 19430.315 | 21278.495 | 21649.132 | 19741.054 | 25757.576 |
| 215 | 21609.989 | 28624.973 | 22209.407 | 21613.152 | 31680 | 21581.155 | 22111.468 | 22754.768 | 21088.62 | 19406.333 | 21249.933 | 21620.267 | 19715.217 | 25757.576 |
| 216 | 21580.922 | 28606.206 | 22182.584 | 21584.764 | 31680 | 21581.155 | 22087.945 | 22744.439 | 21084.396 | 19382.411 | 21221.448 | 21601.066 | 19689.566 | 25757.576 |
| 217 | 21552.066 | 28587.465 | 22155.949 | 21565.879 | 31680 | 21581.155 | 22064.58 | 22734.12 | 21080.193 | 19357.058 | 21193.039 | 21572.328 | 19664.099 | 25757.576 |
| 218 | 21523.418 | 28568.747 | 22129.5 | 21547.028 | 31680 | 21581.155 | 22041.37 | 22723.81 | 21076.011 | 19333.256 | 21164.706 | 21543.667 | 19638.813 | 25757.576 |
| 219 | 21494.977 | 28550.055 | 22103.233 | 21528.21 | 31680 | 21581.155 | 22018.315 | 22713.509 | 21071.849 | 19310.255 | 21136.449 | 21524.602 | 19613.708 | 25757.576 |
| 220 | 21466.739 | 28531.386 | 22077.148 | 21509.424 | 31680 | 21581.155 | 21995.412 | 22703.217 | 21067.708 | 19285.829 | 21108.267 | 21496.067 | 19588.78 | 25757.576 |
| 221 | 21438.702 | 28512.742 | 22051.241 | 21490.671 | 31680 | 21581.155 | 21972.66 | 22692.935 | 21063.588 | 19262.203 | 21080.16 | 21467.608 | 19564.028 | 25757.576 |
| 222 | 21410.864 | 28494.123 | 22025.511 | 21462.603 | 31680 | 21581.155 | 21950.057 | 22672.398 | 21059.487 | 19239.37 | 21052.128 | 21448.677 | 19539.448 | 25757.576 |
| 223 | 21383.222 | 28475.528 | 21999.956 | 21443.932 | 31680 | 21581.155 | 21927.601 | 22662.144 | 21055.407 | 19215.123 | 21024.17 | 21420.343 | 19515.04 | 25757.576 |
| 224 | 21355.774 | 28456.957 | 21974.573 | 21425.293 | 31680 | 21581.155 | 21905.291 | 22651.899 | 21051.346 | 19192.402 | 20996.286 | 21392.084 | 19490.802 | 25757.576 |
| 225 | 21328.518 | 28438.41 | 21949.362 | 21406.687 | 31680 | 21581.155 | 21883.125 | 22641.663 | 21047.305 | 19169.734 | 20968.477 | 21373.286 | 19466.73 | 25757.576 |
| 226 | 21301.451 | 28419.887 | 21924.319 | 21388.113 | 31680 | 21581.155 | 21861.101 | 22631.436 | 21043.283 | 19146.391 | 20940.741 | 21345.151 | 19442.824 | 25757.576 |
| 227 | 21274.571 | 28401.389 | 21899.442 | 21369.571 | 31680 | 21581.155 | 21839.218 | 22621.219 | 21039.28 | 19123.831 | 20913.078 | 21326.436 | 19419.081 | 25757.576 |
| 228 | 21247.876 | 28382.914 | 21874.731 | 21351.061 | 31680 | 21581.155 | 21817.474 | 22611.011 | 21035.297 | 19102.775 | 20894.677 | 21298.424 | 19395.499 | 25757.576 |
| 229 | 21221.364 | 28364.464 | 21850.182 | 21332.583 | 31680 | 21581.155 | 21795.868 | 22600.812 | 21031.332 | 19079.595 | 20867.135 | 21270.485 | 19372.078 | 25757.576 |
| 230 | 21195.032 | 28346.037 | 21825.795 | 21314.137 | 31680 | 21581.155 | 21774.398 | 22590.622 | 21027.386 | 19057.914 | 20839.667 | 21251.9 | 19348.813 | 25757.576 |
| 231 | 21168.879 | 28327.635 | 21801.567 | 21286.528 | 31680 | 21581.155 | 21753.063 | 22590.622 | 21023.458 | 19034.843 | 20812.27 | 21224.084 | 19325.705 | 25757.576 |
| 232 | 21142.903 | 28309.256 | 21777.497 | 21268.162 | 31680 | 21581.155 | 21731.861 | 22580.442 | 21019.549 | 19013.264 | 20784.945 | 21205.58 | 19302.751 | 25757.576 |
| 233 | 21117.101 | 28290.901 | 21753.582 | 21249.828 | 31680 | 21581.155 | 21710.791 | 22570.27 | 21015.658 | 18991.734 | 20757.692 | 21177.884 | 19279.95 | 25757.576 |
| 234 | 21091.472 | 28272.57 | 21729.822 | 21231.525 | 31680 | 21581.155 | 21689.851 | 22560.108 | 21011.785 | 18970.252 | 20739.563 | 21159.461 | 19257.299 | 25757.576 |
| 235 | 21066.013 | 28254.263 | 21706.214 | 21213.253 | 31680 | 21581.155 | 21669.04 | 22549.955 | 21007.93 | 18948.819 | 20712.429 | 21131.885 | 19234.797 | 25757.576 |
| 236 | 21040.723 | 28235.979 | 21682.757 | 21195.013 | 31680 | 21581.155 | 21648.357 | 22539.811 | 21004.093 | 18927.435 | 20685.366 | 21113.542 | 19212.442 | 25757.576 |
| 237 | 21015.6 | 28217.719 | 21659.449 | 21176.804 | 31680 | 21581.155 | 21627.801 | 22529.676 | 21000.273 | 18906.099 | 20658.373 | 21086.086 | 19190.233 | 25757.576 |
| 238 | 20990.641 | 28199.483 | 21636.288 | 21158.627 | 31680 | 21581.155 | 21607.369 | 22529.676 | 20996.47 | 18884.81 | 20640.417 | 21067.822 | 19168.168 | 25757.576 |
| 239 | 20965.846 | 28181.27 | 21613.274 | 21140.48 | 31680 | 21581.155 | 21587.061 | 22519.551 | 20992.685 | 18864.277 | 20613.542 | 21040.484 | 19146.246 | 25757.576 |
| 240 | 20941.212 | 28163.081 | 21590.403 | 21122.365 | 31680 | 21581.155 | 21574.772 | 22509.434 | 20988.917 | 18843.789 | 20586.736 | 21022.299 | 19124.465 | 25757.576 |
| 241 | 20916.737 | 28144.915 | 21567.675 | 21104.281 | 31680 | 21581.155 | 21562.547 | 22499.326 | 20985.166 | 18823.345 | 20560 | 20995.08 | 19102.823 | 25757.576 |
| 242 | 20892.42 | 28126.773 | 21545.089 | 21086.228 | 31680 | 21581.155 | 21550.387 | 22489.228 | 20981.431 | 18802.945 | 20542.215 | 20976.973 | 19081.319 | 25757.576 |
| 243 | 20868.259 | 28108.654 | 21522.642 | 21068.205 | 31680 | 21581.155 | 21538.291 | 22489.228 | 20977.714 | 18782.589 | 20515.594 | 20958.897 | 19059.951 | 25757.576 |
| 244 | 20844.252 | 28090.558 | 21500.334 | 21050.213 | 31680 | 21581.155 | 21526.257 | 22479.139 | 20974.013 | 18761.578 | 20489.042 | 20931.842 | 19038.718 | 25757.576 |
| 245 | 20820.398 | 28072.486 | 21478.162 | 21032.253 | 31680 | 21581.155 | 21514.286 | 22469.058 | 20970.328 | 18742.01 | 20471.379 | 20913.844 | 19017.619 | 25757.576 |
| 246 | 20796.695 | 28054.436 | 21456.126 | 21014.322 | 31680 | 21581.155 | 21502.377 | 22458.987 | 20966.659 | 18721.089 | 20444.942 | 20886.904 | 18996.651 | 25757.576 |
| 247 | 20773.141 | 28036.41 | 21434.223 | 21005.369 | 31680 | 21581.155 | 21490.528 | 22458.987 | 20963.007 | 18701.606 | 20418.573 | 20868.983 | 18975.815 | 25757.576 |
| 248 | 20749.735 | 28018.408 | 21412.453 | 20987.484 | 31680 | 21581.155 | 21478.741 | 22448.925 | 20959.37 | 18682.856 | 20401.031 | 20851.093 | 18955.107 | 25757.576 |
| 249 | 20726.476 | 28000.428 | 21390.815 | 20969.63 | 31680 | 21581.155 | 21467.013 | 22438.871 | 20955.749 | 18662.067 | 20374.775 | 20824.315 | 18934.527 | 25757.576 |
| 250 | 20703.361 | 27982.471 | 21369.306 | 20951.806 | 31680 | 21581.155 | 21455.345 | 22438.871 | 20952.144 | 18642.706 | 20348.586 | 20806.501 | 18914.074 | 25757.576 |
| 251 | 20680.388 | 27964.537 | 21347.925 | 20934.013 | 31680 | 21581.155 | 21443.737 | 22428.827 | 20948.555 | 18623.385 | 20331.164 | 20788.718 | 18893.746 | 25757.576 |
| 252 | 20657.558 | 27946.627 | 21326.672 | 20916.249 | 31680 | 21581.155 | 21432.186 | 22418.792 | 20944.981 | 18604.104 | 20305.088 | 20762.1 | 18873.542 | 25757.576 |
| 253 | 20634.868 | 27928.739 | 21305.545 | 20898.516 | 31680 | 21581.155 | 21420.694 | 22418.792 | 20941.422 | 18584.863 | 20287.74 | 20744.392 | 18853.461 | 25757.576 |
| 254 | 20612.316 | 27910.874 | 21284.542 | 20880.813 | 31680 | 21581.155 | 21409.258 | 22408.766 | 20937.879 | 18565.662 | 20261.775 | 20726.715 | 18833.501 | 25757.576 |
| 255 | 20589.902 | 27893.032 | 21263.662 | 20863.14 | 31680 | 21581.155 | 21397.88 | 22408.766 | 20934.35 | 18547.184 | 20235.876 | 20700.255 | 18813.661 | 25757.576 |
| 256 | 20567.623 | 27875.213 | 21242.905 | 20845.497 | 31680 | 21581.155 | 21386.558 | 22398.748 | 20930.837 | 18528.06 | 20218.646 | 20682.653 | 18793.94 | 25757.576 |
| 257 | 20545.479 | 27857.416 | 21222.268 | 20836.686 | 31680 | 21581.155 | 21375.292 | 22388.74 | 20927.338 | 18509.657 | 20192.857 | 20665.081 | 18774.336 | 25757.576 |
| 258 | 20523.467 | 27839.643 | 21201.751 | 20819.088 | 31680 | 21581.155 | 21364.082 | 22388.74 | 20923.854 | 18490.61 | 20175.701 | 20638.778 | 18754.849 | 25757.576 |
| 259 | 20501.588 | 27821.892 | 21181.353 | 20801.519 | 31680 | 21581.155 | 21352.926 | 22378.741 | 20920.385 | 18472.281 | 20150.021 | 20621.28 | 18735.478 | 25757.576 |
| 260 | 20479.838 | 27804.163 | 21161.072 | 20783.98 | 31680 | 21581.155 | 21341.825 | 22378.741 | 20916.93 | 18453.989 | 20132.938 | 20603.812 | 18716.22 | 25757.576 |
| 261 | 20458.218 | 27786.457 | 21140.907 | 20766.47 | 31680 | 21581.155 | 21330.777 | 22368.75 | 20913.489 | 18435.732 | 20107.367 | 20586.373 | 18697.075 | 25757.576 |
| 262 | 20436.726 | 27768.774 | 21120.857 | 20748.99 | 31680 | 21581.155 | 21319.783 | 22368.75 | 20910.063 | 18418.186 | 20090.355 | 20560.27 | 18678.043 | 25757.576 |
| 263 | 20415.359 | 27751.113 | 21100.921 | 20740.261 | 31680 | 21581.155 | 21308.842 | 22358.768 | 20906.651 | 18399.327 | 20064.892 | 20542.905 | 18659.121 | 25757.576 |
| 264 | 20394.118 | 27733.475 | 21081.098 | 20722.825 | 31680 | 21581.155 | 21297.954 | 22348.796 | 20903.252 | 18381.85 | 20047.953 | 20525.57 | 18640.308 | 25757.576 |
| 265 | 20373.001 | 27715.859 | 21061.386 | 20705.418 | 31680 | 21581.155 | 21287.117 | 22348.796 | 20899.868 | 18363.066 | 20022.597 | 20508.263 | 18621.604 | 25757.576 |
| 266 | 20352.007 | 27698.265 | 21041.785 | 20688.04 | 31680 | 21581.155 | 21276.333 | 22338.832 | 20896.497 | 18346.326 | 20005.729 | 20490.986 | 18603.008 | 25757.576 |
| 267 | 20331.134 | 27680.694 | 21022.293 | 20670.692 | 31680 | 21581.155 | 21265.599 | 22338.832 | 20893.14 | 18327.614 | 19980.48 | 20465.124 | 18584.518 | 25757.576 |
| 268 | 20310.381 | 27663.145 | 21002.91 | 20662.028 | 31680 | 21581.155 | 21254.916 | 22328.877 | 20889.797 | 18310.94 | 19963.682 | 20447.919 | 18566.133 | 25757.576 |
| 269 | 20289.748 | 27645.618 | 20983.634 | 20644.724 | 31680 | 21581.155 | 21244.284 | 22328.877 | 20886.467 | 18293.63 | 19946.913 | 20430.743 | 18547.853 | 25757.576 |
| 270 | 20269.232 | 27628.113 | 20964.465 | 20627.448 | 31680 | 21581.155 | 21233.701 | 22318.931 | 20883.151 | 18275.689 | 19921.812 | 20413.596 | 18529.676 | 25757.576 |
| 271 | 20248.833 | 27610.631 | 20945.401 | 20610.201 | 31680 | 21581.155 | 21223.168 | 22318.931 | 20879.848 | 18258.446 | 19905.113 | 20396.478 | 18511.601 | 25757.576 |
| 272 | 20228.55 | 27593.17 | 20926.442 | 20601.588 | 31680 | 21581.155 | 21212.684 | 22318.931 | 20876.558 | 18241.236 | 19880.117 | 20370.854 | 18493.628 | 25757.576 |
| 273 | 20208.382 | 27575.732 | 20907.586 | 20584.384 | 31680 | 21581.155 | 21202.248 | 22308.994 | 20873.281 | 18224.057 | 19863.488 | 20353.808 | 18475.755 | 25757.576 |
| 274 | 20188.326 | 27558.316 | 20888.832 | 20567.209 | 31680 | 21581.155 | 21191.861 | 22308.994 | 20870.017 | 18206.912 | 19846.887 | 20336.789 | 18457.982 | 25757.576 |
| 275 | 20168.383 | 27540.922 | 20870.18 | 20541.5 | 31680 | 21581.155 | 21181.522 | 22299.065 | 20866.765 | 18189.798 | 19822.037 | 20319.799 | 18440.307 | 25757.576 |
| 276 | 20148.552 | 27523.549 | 20851.629 | 20541.5 | 31680 | 21581.155 | 21171.23 | 22299.065 | 20863.527 | 18174.029 | 19805.505 | 20302.838 | 18422.729 | 25757.576 |
| 277 | 20128.83 | 27506.199 | 20833.177 | 20541.5 | 31680 | 21581.155 | 21160.984 | 22289.146 | 20860.301 | 18156.977 | 19780.758 | 20285.905 | 18405.248 | 25757.576 |
| 278 | 20109.218 | 27488.87 | 20814.823 | 20541.5 | 31680 | 21581.155 | 21150.786 | 22289.146 | 20857.088 | 18140.611 | 19764.295 | 20269 | 18387.863 | 25757.576 |
| 279 | 20089.714 | 27471.563 | 20796.568 | 20541.5 | 31680 | 21581.155 | 21140.634 | 22279.235 | 20853.888 | 18124.275 | 19747.859 | 20252.123 | 18370.573 | 25757.576 |
| 280 | 20070.317 | 27454.279 | 20778.41 | 20541.5 | 31680 | 21581.155 | 21130.528 | 22279.235 | 20850.699 | 18107.316 | 19723.256 | 20226.861 | 18353.377 | 25757.576 |
| 281 | 20051.026 | 27437.015 | 20760.347 | 20541.5 | 31680 | 21581.155 | 21120.467 | 22279.235 | 20847.523 | 18091.04 | 19706.888 | 20210.054 | 18336.274 | 25757.576 |
| 282 | 20031.841 | 27419.774 | 20742.38 | 20541.5 | 31680 | 21581.155 | 21110.451 | 22269.333 | 20844.359 | 18074.793 | 19690.547 | 20193.275 | 18319.263 | 25757.576 |
| 283 | 20012.759 | 27402.554 | 20724.507 | 20541.5 | 31680 | 21581.155 | 21100.481 | 22269.333 | 20841.208 | 18058.574 | 19666.087 | 20176.524 | 18302.343 | 25757.576 |
| 284 | 19993.781 | 27385.356 | 20706.727 | 20541.5 | 31680 | 21581.155 | 21090.554 | 22259.44 | 20838.068 | 18042.385 | 19649.814 | 20159.801 | 18285.514 | 25757.576 |
| 285 | 19974.905 | 27368.179 | 20689.04 | 20541.5 | 31680 | 21581.155 | 21080.672 | 22259.44 | 20834.94 | 18026.871 | 19633.568 | 20143.106 | 18268.775 | 25757.576 |
| 286 | 19956.13 | 27351.024 | 20671.445 | 20541.5 | 31680 | 21581.155 | 21070.833 | 22259.44 | 20831.825 | 18010.094 | 19617.348 | 20126.438 | 18252.125 | 25757.576 |
| 287 | 19937.456 | 27333.89 | 20653.941 | 20541.5 | 31680 | 21581.155 | 21061.038 | 22249.556 | 20828.721 | 17994.635 | 19593.069 | 20109.797 | 18235.562 | 25757.576 |
| 288 | 19918.881 | 27316.778 | 20636.527 | 20541.5 | 31680 | 21581.155 | 21051.286 | 22249.556 | 20825.628 | 17979.203 | 19576.917 | 20093.185 | 18219.087 | 25757.576 |
| 289 | 19900.404 | 27299.687 | 20619.202 | 20541.5 | 31680 | 21581.155 | 21041.576 | 22249.556 | 20822.547 | 17963.797 | 19560.791 | 20076.599 | 18202.699 | 25757.576 |
| 290 | 19882.026 | 27282.618 | 20601.966 | 20541.5 | 31680 | 21581.155 | 21031.909 | 22239.68 | 20819.478 | 17947.138 | 19536.652 | 20060.041 | 18186.396 | 25757.576 |
| 291 | 19863.744 | 27265.57 | 20584.817 | 20541.5 | 31680 | 21581.155 | 21022.284 | 22239.68 | 20816.42 | 17932.426 | 19520.592 | 20043.511 | 18170.178 | 25757.576 |
| 292 | 19845.558 | 27248.543 | 20567.756 | 20541.5 | 31680 | 21581.155 | 21012.7 | 22229.814 | 20813.374 | 17916.462 | 19504.559 | 20027.007 | 18154.044 | 25757.576 |
| 293 | 19827.467 | 27231.537 | 20550.78 | 20541.5 | 31680 | 21581.155 | 21003.158 | 22229.814 | 20810.338 | 17901.8 | 19488.551 | 20010.531 | 18137.994 | 25757.576 |
| 294 | 19809.47 | 27214.553 | 20533.891 | 20541.5 | 31680 | 21581.155 | 20993.656 | 22229.814 | 20807.314 | 17885.891 | 19464.59 | 19994.081 | 18122.026 | 25757.576 |
| 295 | 19791.567 | 27197.59 | 20517.086 | 20541.5 | 31680 | 21581.155 | 20984.196 | 22219.956 | 20804.301 | 17871.279 | 19448.649 | 19977.659 | 18106.141 | 25757.576 |
| 296 | 19773.756 | 27180.648 | 20500.365 | 20541.5 | 31680 | 21581.155 | 20974.776 | 22219.956 | 20801.299 | 17856.058 | 19432.733 | 19961.264 | 18090.337 | 25757.576 |
| 297 | 19756.037 | 27163.727 | 20483.727 | 20541.5 | 31680 | 21581.155 | 20965.396 | 22219.956 | 20798.308 | 17840.862 | 19416.844 | 19944.895 | 18074.613 | 25757.576 |
| 298 | 19738.409 | 27146.827 | 20467.172 | 20541.5 | 31680 | 21581.155 | 20956.055 | 22210.106 | 20795.328 | 17825.693 | 19400.98 | 19928.554 | 18058.969 | 25757.576 |
| 299 | 19720.871 | 27129.948 | 20450.699 | 20541.5 | 31680 | 21581.155 | 20946.754 | 22210.106 | 20792.359 | 17811.179 | 19377.234 | 19912.239 | 18043.404 | 25757.576 |
| 300 | 19703.422 | 27113.09 | 20434.307 | 20541.5 | 23180.488 | 21581.155 | 20937.493 | 22210.106 | 20789.4 | 17796.06 | 19361.435 | 19895.951 | 18027.918 | 25757.576 |
| 301 | 19686.062 | 27096.253 | 20417.995 | 20541.5 | 23180.488 | 21581.155 | 20928.27 | 22200.266 | 20786.452 | 17780.966 | 19345.662 | 19879.689 | 18012.509 | 25757.576 |
| 302 | 19668.79 | 27079.437 | 20401.764 | 20541.5 | 23180.488 | 21581.155 | 20919.086 | 22200.266 | 20783.515 | 17766.525 | 19329.915 | 19863.454 | 17997.178 | 25757.576 |
| 303 | 19651.605 | 27062.642 | 20385.611 | 20541.5 | 23180.488 | 21581.155 | 20909.94 | 22200.266 | 20780.588 | 17752.108 | 19314.193 | 19847.246 | 17981.923 | 25757.576 |
| 304 | 19634.506 | 27045.868 | 20369.537 | 20541.5 | 23180.488 | 21581.155 | 20900.832 | 22190.434 | 20777.672 | 17737.714 | 19298.497 | 19831.064 | 17966.744 | 25757.576 |
| 305 | 19617.492 | 27029.114 | 20353.541 | 20541.5 | 23180.488 | 21581.155 | 20891.761 | 22190.434 | 20774.766 | 17722.719 | 19275 | 19814.908 | 17951.64 | 25757.576 |
| 306 | 19600.564 | 27012.381 | 20337.622 | 20541.5 | 23180.488 | 21581.155 | 20882.728 | 22190.434 | 20771.87 | 17708.373 | 19259.367 | 19798.779 | 17936.611 | 25757.576 |
| 307 | 19583.719 | 26995.669 | 20321.779 | 20541.5 | 23180.488 | 21581.155 | 20873.733 | 22190.434 | 20768.985 | 17694.05 | 19243.76 | 19782.676 | 17921.655 | 25757.576 |
| 308 | 19566.958 | 26978.978 | 20306.013 | 20541.5 | 23180.488 | 21581.155 | 20864.774 | 22180.611 | 20766.109 | 17680.371 | 19228.178 | 19774.634 | 17906.773 | 25757.576 |
| 309 | 19550.28 | 26962.307 | 20290.321 | 20541.5 | 23180.488 | 21581.155 | 20855.852 | 22180.611 | 20763.244 | 17667.954 | 19158.37 | 19758.57 | 17880.706 | 25757.576 |
| 310 | 19533.683 | 26945.657 | 20342.45 | 20541.5 | 23180.488 | 21581.155 | 20846.966 | 22180.611 | 20760.389 | 17666.093 | 19158.37 | 19758.57 | 17878.46 | 25757.576 |
| 311 | 19517.168 | 26929.027 | 20335.61 | 20541.5 | 23180.488 | 21581.155 | 20838.116 | 22170.796 | 20757.543 | 17664.233 | 19158.37 | 19750.548 | 17876.221 | 25757.576 |
| 312 | 19500.734 | 26912.418 | 20328.774 | 20541.5 | 23180.488 | 21581.155 | 20829.302 | 22170.796 | 20754.708 | 17661.752 | 19150.645 | 19750.548 | 17873.991 | 25757.576 |
| 313 | 19484.379 | 26895.829 | 20321.943 | 20541.5 | 23180.488 | 21581.155 | 20820.523 | 22170.796 | 20751.882 | 17659.893 | 19150.645 | 19750.548 | 17871.768 | 25757.576 |
| 314 | 19468.104 | 26879.261 | 20315.116 | 20541.5 | 23180.488 | 21581.155 | 20811.78 | 22160.991 | 20749.066 | 17658.033 | 19150.645 | 19750.548 | 17869.553 | 25757.576 |
| 315 | 19451.907 | 26862.713 | 20308.293 | 20541.5 | 23180.488 | 21581.155 | 20803.072 | 22160.991 | 20746.26 | 17655.555 | 19142.926 | 19742.532 | 17867.345 | 25757.576 |
| 316 | 19435.789 | 26846.185 | 20301.476 | 20541.5 | 23180.488 | 21581.155 | 20794.398 | 22160.991 | 20743.463 | 17653.696 | 19142.926 | 19742.532 | 17865.145 | 25757.576 |
| 317 | 19419.747 | 26829.678 | 20294.663 | 20541.5 | 23180.488 | 21581.155 | 20785.759 | 22160.991 | 20740.676 | 17651.838 | 19142.926 | 19742.532 | 17862.952 | 25757.576 |
| 318 | 19403.783 | 26813.191 | 20287.854 | 20541.5 | 23180.488 | 21581.155 | 20777.155 | 22151.194 | 20737.899 | 17649.362 | 19135.214 | 19734.523 | 17860.767 | 25757.576 |
| 319 | 19387.894 | 26796.725 | 20281.05 | 20541.5 | 23180.488 | 21581.155 | 20768.584 | 22151.194 | 20735.131 | 17647.504 | 19135.214 | 19734.523 | 17858.589 | 25757.576 |
| 320 | 19372.081 | 26780.278 | 20274.251 | 20541.5 | 23180.488 | 21581.155 | 20760.047 | 22151.194 | 20732.372 | 17645.648 | 19135.214 | 19734.523 | 17856.419 | 25757.576 |
| 321 | 19356.343 | 26763.852 | 20267.456 | 20541.5 | 23180.488 | 21581.155 | 20751.544 | 22141.405 | 20729.623 | 17642.554 | 19135.214 | 19734.523 | 17854.255 | 25757.576 |
| 322 | 19340.679 | 26747.446 | 20260.666 | 20541.5 | 23180.488 | 21581.155 | 20743.074 | 22141.405 | 20726.882 | 17640.698 | 19127.507 | 19726.521 | 17852.099 | 25757.576 |
| 323 | 19325.088 | 26731.06 | 20253.88 | 20541.5 | 23180.488 | 21581.155 | 20734.637 | 22141.405 | 20724.151 | 17638.843 | 19127.507 | 19726.521 | 17849.95 | 25757.576 |
| 324 | 19309.571 | 26714.694 | 20247.099 | 20541.5 | 23180.488 | 21581.155 | 20726.232 | 22141.405 | 20721.43 | 17636.988 | 19127.507 | 19726.521 | 17847.809 | 25757.576 |
| 325 | 19294.126 | 26698.348 | 20240.323 | 20541.5 | 23180.488 | 21581.155 | 20717.861 | 22131.625 | 20718.717 | 17634.516 | 19119.807 | 19718.525 | 17845.674 | 25757.576 |
| 326 | 19278.753 | 26682.022 | 20233.55 | 20541.5 | 23180.488 | 21581.155 | 20709.522 | 22131.625 | 20716.013 | 17632.662 | 19119.807 | 19718.525 | 17843.547 | 25757.576 |
| 327 | 19263.452 | 26665.716 | 20226.783 | 20541.5 | 23180.488 | 21581.155 | 20701.214 | 22131.625 | 20713.318 | 17630.808 | 19119.807 | 19718.525 | 17841.426 | 25757.576 |
| 328 | 19248.221 | 26649.43 | 20220.02 | 20541.5 | 23180.488 | 21581.155 | 20692.939 | 22121.854 | 20710.632 | 17628.337 | 19112.113 | 19718.525 | 17839.312 | 25757.576 |
| 329 | 19233.06 | 26633.164 | 20213.261 | 20541.5 | 23180.488 | 21581.155 | 20684.696 | 22121.854 | 20707.955 | 17627.102 | 19112.113 | 19710.535 | 17837.206 | 25757.576 |
| 330 | 19217.969 | 26616.917 | 20206.507 | 20541.5 | 23180.488 | 21581.155 | 20676.484 | 22121.854 | 20705.287 | 17625.25 | 19112.113 | 19710.535 | 17835.106 | 25757.576 |
| 331 | 19202.947 | 26600.691 | 20199.758 | 20541.5 | 23180.488 | 21581.155 | 20668.303 | 22121.854 | 20702.627 | 17622.78 | 19104.425 | 19710.535 | 17833.013 | 25757.576 |
| 332 | 19187.993 | 26584.484 | 20193.013 | 20541.5 | 23180.488 | 21581.155 | 20660.153 | 22112.092 | 20699.977 | 17620.929 | 19104.425 | 19710.535 | 17830.927 | 25757.576 |
| 333 | 19173.107 | 26568.297 | 20186.272 | 20541.5 | 23180.488 | 21581.155 | 20652.035 | 22112.092 | 20697.334 | 17619.078 | 19104.425 | 19702.552 | 17828.847 | 25757.576 |
| 334 | 19158.289 | 26552.13 | 20179.536 | 20541.5 | 23180.488 | 21581.155 | 20643.946 | 22112.092 | 20694.701 | 17617.227 | 19104.425 | 19702.552 | 17826.774 | 25757.576 |
| 335 | 19143.538 | 26535.982 | 20172.805 | 20541.5 | 23180.488 | 21581.155 | 20635.889 | 22102.338 | 20692.076 | 17614.76 | 19096.743 | 19702.552 | 17824.708 | 25757.576 |
| 336 | 19128.854 | 26519.854 | 20166.078 | 20541.5 | 23180.488 | 21581.155 | 20627.861 | 22102.338 | 20689.459 | 17612.91 | 19096.743 | 19694.575 | 17822.649 | 25757.576 |
| 337 | 19114.235 | 26503.746 | 20159.356 | 20541.5 | 23180.488 | 21581.155 | 20619.863 | 22102.338 | 20686.851 | 17611.061 | 19096.743 | 19694.575 | 17820.596 | 25757.576 |
| 338 | 19099.682 | 26487.657 | 20152.638 | 20541.5 | 23180.488 | 21581.155 | 20611.896 | 22102.338 | 20684.251 | 17608.595 | 19089.068 | 19694.575 | 17818.549 | 25757.576 |
| 339 | 19085.193 | 26471.587 | 20145.924 | 20541.5 | 23180.488 | 21581.155 | 20603.957 | 22092.593 | 20681.659 | 17606.747 | 19089.068 | 19694.575 | 17816.509 | 25757.576 |
| 340 | 19070.769 | 26455.538 | 20139.215 | 20541.5 | 23180.488 | 21581.155 | 20596.049 | 22092.593 | 20679.076 | 17604.899 | 19089.068 | 19686.605 | 17814.476 | 25757.576 |
| 341 | 19056.409 | 26439.507 | 20132.51 | 20541.5 | 23180.488 | 21581.155 | 20588.169 | 22092.593 | 20676.501 | 17602.435 | 19089.068 | 19686.605 | 17812.449 | 25757.576 |
| 342 | 19042.112 | 26423.496 | 20125.81 | 20541.5 | 23180.488 | 21581.155 | 20580.318 | 22082.856 | 20673.934 | 17600.588 | 19081.398 | 19686.605 | 17810.428 | 25757.576 |
| 343 | 19027.879 | 26407.505 | 20119.114 | 20541.5 | 23180.488 | 21581.155 | 20572.497 | 22082.856 | 20671.375 | 17598.741 | 19081.398 | 19686.605 | 17808.414 | 25757.576 |
| 344 | 19013.708 | 26391.532 | 20112.423 | 20541.5 | 23180.488 | 21581.155 | 20564.703 | 22082.856 | 20668.824 | 17597.51 | 19081.398 | 19678.641 | 17806.406 | 25757.576 |
| 345 | 18999.598 | 26375.579 | 20105.736 | 20541.5 | 23180.488 | 21581.155 | 20556.939 | 22082.856 | 20666.281 | 17595.664 | 19073.735 | 19678.641 | 17804.404 | 25757.576 |
| 346 | 18985.551 | 26359.646 | 20099.054 | 20541.5 | 23180.488 | 21581.155 | 20549.202 | 22073.128 | 20663.746 | 17593.818 | 19073.735 | 19678.641 | 17802.409 | 25757.576 |
| 347 | 18971.564 | 26343.731 | 20092.376 | 20541.5 | 23180.488 | 21581.155 | 20541.494 | 22073.128 | 20661.219 | 17591.972 | 19073.735 | 19678.641 | 17800.419 | 25757.576 |
| 348 | 18957.638 | 26327.836 | 20085.703 | 20541.5 | 23180.488 | 21581.155 | 20533.813 | 22073.128 | 20658.7 | 17589.512 | 19066.078 | 19670.683 | 17798.436 | 25757.576 |
| 349 | 18943.773 | 26311.96 | 20079.034 | 20541.5 | 23180.488 | 21581.155 | 20526.16 | 22063.408 | 20656.189 | 17587.668 | 19066.078 | 19670.683 | 17796.459 | 25757.576 |
| 350 | 18929.967 | 26296.103 | 20072.369 | 20541.5 | 23180.488 | 21581.155 | 20518.535 | 22063.408 | 20653.686 | 17585.824 | 19066.078 | 19670.683 | 17794.488 | 25757.576 |
| 351 | 18916.22 | 26280.265 | 20065.709 | 20541.5 | 23180.488 | 21581.155 | 20510.937 | 22063.408 | 20651.19 | 17583.98 | 19066.078 | 19670.683 | 17792.523 | 25757.576 |
| 352 | 18902.532 | 26264.446 | 20059.053 | 20541.5 | 23180.488 | 21581.155 | 20503.366 | 22063.408 | 20648.702 | 17582.136 | 19058.427 | 19662.732 | 17790.564 | 25757.576 |
| 353 | 18888.903 | 26248.646 | 20052.402 | 20541.5 | 23180.488 | 21581.155 | 20495.822 | 22053.697 | 20646.221 | 17580.294 | 19058.427 | 19662.732 | 17788.611 | 25757.576 |
| 354 | 18875.332 | 26232.866 | 20045.755 | 20541.5 | 23180.488 | 21581.155 | 20488.305 | 22053.697 | 20643.749 | 17578.451 | 19058.427 | 19662.732 | 17786.664 | 25757.576 |
| 355 | 18861.818 | 26217.104 | 20039.112 | 20541.5 | 23180.488 | 21581.155 | 20480.815 | 22053.697 | 20641.283 | 17575.995 | 19058.427 | 19662.732 | 17784.723 | 25757.576 |
| 356 | 18848.361 | 26201.361 | 20032.474 | 20541.5 | 23180.488 | 21581.155 | 20473.351 | 22053.697 | 20638.826 | 17574.153 | 19050.782 | 19654.788 | 17782.788 | 25757.576 |
| 357 | 18834.961 | 26185.637 | 20025.841 | 20541.5 | 23180.488 | 21581.155 | 20465.913 | 22043.995 | 20636.375 | 17572.312 | 19050.782 | 19654.788 | 17780.858 | 25757.576 |
| 358 | 18821.618 | 26169.932 | 20019.211 | 20541.5 | 23180.488 | 21581.155 | 20458.502 | 22043.995 | 20633.932 | 17571.084 | 19050.782 | 19654.788 | 17778.935 | 25757.576 |
| 359 | 18808.33 | 26154.246 | 20012.586 | 20541.5 | 23180.488 | 21581.155 | 20451.116 | 22043.995 | 20631.497 | 17568.63 | 19043.144 | 19654.788 | 17777.017 | 25757.576 |
| 360 | 18795.098 | 26138.578 | 20005.966 | 20541.5 | 23180.488 | 21581.155 | 20443.756 | 22034.301 | 20629.069 | 17567.403 | 19043.144 | 19646.85 | 17775.104 | 25757.576 |
| 361 | 18781.921 | 26122.93 | 19999.349 | 20541.5 | 23180.488 | 21581.155 | 20436.422 | 22034.301 | 20626.648 | 17565.563 | 19043.144 | 19646.85 | 17773.198 | 25757.576 |
| 362 | 18768.799 | 26107.3 | 19992.738 | 20541.5 | 23180.488 | 21581.155 | 20429.113 | 22034.301 | 20624.234 | 17564.337 | 19043.144 | 19646.85 | 17771.297 | 25757.576 |
| 363 | 18755.731 | 26091.688 | 19986.13 | 20541.5 | 23180.488 | 21581.155 | 20421.83 | 22034.301 | 20621.828 | 17561.885 | 19035.511 | 19646.85 | 17769.402 | 25757.576 |
| 364 | 18742.717 | 26076.096 | 19979.527 | 20541.5 | 23180.488 | 21581.155 | 20414.572 | 22024.615 | 20619.428 | 17560.046 | 19035.511 | 19638.918 | 17767.513 | 25757.576 |
| 365 | 18729.757 | 26060.522 | 19972.928 | 20541.5 | 23180.488 | 21581.155 | 20407.338 | 22024.615 | 20617.036 | 17558.208 | 19035.511 | 19638.918 | 17765.629 | 25757.576 |
| 366 | 18716.85 | 26044.966 | 19966.334 | 20541.5 | 23180.488 | 21581.155 | 20400.13 | 22024.615 | 20614.651 | 17556.37 | 19027.885 | 19638.918 | 17763.75 | 25757.576 |
| 367 | 18703.996 | 26029.429 | 19959.744 | 20541.5 | 23180.488 | 21581.155 | 20392.946 | 22014.938 | 20612.273 | 17554.532 | 19027.885 | 19638.918 | 17761.877 | 25757.576 |
| 368 | 18691.194 | 26013.911 | 19953.158 | 20541.5 | 23180.488 | 21581.155 | 20385.787 | 22014.938 | 20609.902 | 17552.695 | 19027.885 | 19630.993 | 17760.01 | 25757.576 |
| 369 | 18678.444 | 25998.411 | 19946.577 | 20541.5 | 23180.488 | 21581.155 | 20378.652 | 22014.938 | 20607.538 | 17550.858 | 19027.885 | 19630.993 | 17758.148 | 25757.576 |
| 370 | 18665.746 | 25982.93 | 19940 | 20541.5 | 23180.488 | 21581.155 | 20371.542 | 22014.938 | 20605.18 | 17549.022 | 19020.264 | 19630.993 | 17756.291 | 25757.576 |
| 371 | 18653.099 | 25967.467 | 19933.427 | 20541.5 | 23180.488 | 21581.155 | 20364.455 | 22005.27 | 20602.83 | 17547.186 | 19020.264 | 19630.993 | 17754.44 | 25757.576 |
| 372 | 18640.504 | 25952.022 | 19926.859 | 20541.5 | 23180.488 | 21581.155 | 20357.393 | 22005.27 | 20600.487 | 17545.35 | 19020.264 | 19623.074 | 17752.594 | 25757.576 |
| 373 | 18627.959 | 25936.596 | 19920.295 | 20541.5 | 23180.488 | 21581.155 | 20350.354 | 22005.27 | 20598.15 | 17544.126 | 19020.264 | 19623.074 | 17750.754 | 25757.576 |
| 374 | 18615.464 | 25921.188 | 19913.736 | 20541.5 | 23180.488 | 21581.155 | 20343.339 | 21995.61 | 20595.82 | 17541.68 | 19012.65 | 19623.074 | 17748.918 | 25757.576 |
| 375 | 18603.019 | 25905.799 | 19907.18 | 20541.5 | 23180.488 | 21581.155 | 20336.347 | 21995.61 | 20593.497 | 17539.845 | 19012.65 | 19623.074 | 17747.088 | 25757.576 |
| 376 | 18590.624 | 25890.427 | 19900.629 | 20541.5 | 23180.488 | 21581.155 | 20329.379 | 21995.61 | 20591.18 | 17538.622 | 19012.65 | 19615.161 | 17745.264 | 25757.576 |
| 377 | 18578.278 | 25875.074 | 19894.082 | 20541.5 | 23180.488 | 21581.155 | 20322.434 | 21995.61 | 20588.871 | 17536.789 | 19012.65 | 19615.161 | 17743.444 | 25757.576 |
| 378 | 18565.981 | 25859.739 | 19887.54 | 20541.5 | 23180.488 | 21581.155 | 20315.512 | 21985.959 | 20586.567 | 17534.955 | 19005.042 | 19615.161 | 17741.63 | 25757.576 |
| 379 | 18553.733 | 25844.423 | 19881.002 | 20541.5 | 23180.488 | 21581.155 | 20308.613 | 21985.959 | 20584.271 | 17533.733 | 19005.042 | 19615.161 | 17739.821 | 25757.576 |
| 380 | 18541.533 | 25829.124 | 19874.468 | 20541.5 | 23180.488 | 21581.155 | 20301.737 | 21985.959 | 20581.981 | 17531.9 | 19005.042 | 19607.255 | 17738.016 | 25757.576 |
| 381 | 18529.381 | 25813.843 | 19867.939 | 20541.5 | 23180.488 | 21581.155 | 20294.883 | 21976.316 | 20579.697 | 17530.068 | 18997.44 | 19607.255 | 17736.217 | 25757.576 |
| 382 | 18517.277 | 25798.581 | 19861.413 | 20541.5 | 23180.488 | 21581.155 | 20288.052 | 21976.316 | 20577.42 | 17528.235 | 18997.44 | 19607.255 | 17734.424 | 25757.576 |
| 383 | 18505.219 | 25783.337 | 19854.892 | 20541.5 | 23180.488 | 21581.155 | 20281.243 | 21976.316 | 20575.149 | 17526.404 | 18997.44 | 19607.255 | 17732.635 | 25757.576 |
| 384 | 18493.209 | 25768.11 | 19848.376 | 20541.5 | 23180.488 | 21581.155 | 20274.457 | 21976.316 | 20572.885 | 17525.183 | 18997.44 | 19607.255 | 17730.851 | 25757.576 |
| 385 | 18481.246 | 25752.902 | 19841.863 | 20541.5 | 23180.488 | 21581.155 | 20267.693 | 21966.681 | 20570.627 | 17522.742 | 18989.844 | 19599.355 | 17729.072 | 25757.576 |
| 386 | 18469.329 | 25737.711 | 19835.355 | 20541.5 | 23180.488 | 21581.155 | 20260.95 | 21966.681 | 20568.376 | 17521.521 | 18989.844 | 19599.355 | 17727.298 | 25757.576 |
| 387 | 18457.458 | 25722.539 | 19828.851 | 20541.5 | 23180.488 | 21581.155 | 20254.23 | 21966.681 | 20566.13 | 17519.691 | 18989.844 | 19599.355 | 17725.529 | 25757.576 |
| 388 | 18445.632 | 25707.384 | 19822.352 | 20541.5 | 23180.488 | 21581.155 | 20247.531 | 21957.055 | 20563.891 | 17517.861 | 18989.844 | 19599.355 | 17723.765 | 25757.576 |
| 389 | 18433.853 | 25692.247 | 19815.857 | 20541.5 | 23180.488 | 21581.155 | 20240.854 | 21957.055 | 20561.659 | 17516.031 | 18982.254 | 19591.462 | 17722.006 | 25757.576 |
| 390 | 18422.118 | 25677.128 | 19809.365 | 20541.5 | 23180.488 | 21581.155 | 20234.198 | 21957.055 | 20559.432 | 17514.202 | 18982.254 | 19591.462 | 17720.251 | 25757.576 |
| 391 | 18410.428 | 25662.027 | 19802.879 | 20541.5 | 23180.488 | 21581.155 | 20227.564 | 21957.055 | 20557.212 | 17512.983 | 18982.254 | 19591.462 | 17718.502 | 25757.576 |
| 392 | 18398.783 | 25646.944 | 19796.396 | 20541.5 | 23180.488 | 21581.155 | 20220.951 | 21947.438 | 20554.998 | 17511.154 | 18982.254 | 19591.462 | 17716.757 | 25757.576 |
| 393 | 18387.182 | 25631.878 | 19789.918 | 20541.5 | 23180.488 | 21581.155 | 20214.359 | 21947.438 | 20552.789 | 17509.326 | 18974.67 | 19583.575 | 17715.017 | 25757.576 |
| 394 | 18375.624 | 25616.83 | 19783.444 | 20541.5 | 23180.488 | 21581.155 | 20207.788 | 21947.438 | 20550.587 | 17507.499 | 18974.67 | 19583.575 | 17713.282 | 25757.576 |
| 395 | 18364.111 | 25601.799 | 19776.974 | 20541.5 | 23180.488 | 21581.155 | 20201.238 | 21937.828 | 20548.391 | 17506.889 | 18974.67 | 19583.575 | 17711.551 | 25757.576 |
| 396 | 18352.641 | 25586.787 | 19770.508 | 20541.5 | 23180.488 | 21581.155 | 20194.709 | 21937.828 | 20546.201 | 17505.062 | 18974.67 | 19583.575 | 17709.826 | 25757.576 |
| 397 | 18341.214 | 25571.791 | 19764.047 | 20541.5 | 23180.488 | 21581.155 | 20188.2 | 21937.828 | 20544.017 | 17503.235 | 18967.093 | 19583.575 | 17708.105 | 25757.576 |
| 398 | 18329.83 | 25556.814 | 19757.59 | 20541.5 | 23180.488 | 21581.155 | 20181.712 | 21937.828 | 20541.839 | 17501.409 | 18967.093 | 19575.694 | 17706.388 | 25757.576 |
| 399 | 18318.489 | 25541.854 | 19751.137 | 20541.5 | 23180.488 | 21581.155 | 20175.244 | 21928.228 | 20539.667 | 17500.191 | 18967.093 | 19575.694 | 17704.676 | 25757.576 |
| 400 | 18307.19 | 25526.911 | 19744.688 | 20541.5 | 23180.488 | 21581.155 | 20168.797 | 21928.228 | 20537.501 | 17498.365 | 18967.093 | 19575.694 | 17702.969 | 25757.576 |
| 401 | 18295.932 | 25511.986 | 19738.243 | 20541.5 | 23180.488 | 21581.155 | 20162.37 | 21928.228 | 20535.34 | 17496.54 | 18959.521 | 19575.694 | 17701.267 | 25757.576 |
| 402 | 18284.717 | 25497.078 | 19731.803 | 20541.5 | 23180.488 | 21581.155 | 20155.962 | 21928.228 | 20533.186 | 17494.715 | 18959.521 | 19567.82 | 17699.568 | 25757.576 |
| 403 | 18273.543 | 25482.188 | 19725.367 | 20541.5 | 23180.488 | 21581.155 | 20149.575 | 21918.635 | 20531.037 | 17493.498 | 18959.521 | 19567.82 | 17697.875 | 25757.576 |
| 404 | 18262.41 | 25467.315 | 19718.935 | 20541.5 | 23180.488 | 21581.155 | 20143.208 | 21918.635 | 20528.894 | 17491.674 | 18959.521 | 19567.82 | 17696.186 | 25757.576 |
| 405 | 18251.319 | 25452.46 | 19712.507 | 20541.5 | 23180.488 | 21581.155 | 20136.86 | 21918.635 | 20526.756 | 17489.85 | 18951.955 | 19567.82 | 17694.501 | 25757.576 |
| 406 | 18240.268 | 25437.621 | 19706.084 | 20541.5 | 23180.488 | 21581.155 | 20130.532 | 21918.635 | 20524.625 | 17488.026 | 18951.955 | 19567.82 | 17692.821 | 25757.576 |
| 407 | 18229.257 | 25422.801 | 19699.664 | 20541.5 | 23180.488 | 21581.155 | 20124.223 | 21909.051 | 20522.499 | 17486.811 | 18951.955 | 19559.952 | 17691.146 | 25757.576 |
| 408 | 18218.287 | 25407.997 | 19693.249 | 20541.5 | 23180.488 | 21581.155 | 20117.934 | 21909.051 | 20520.378 | 17484.987 | 18951.955 | 19559.952 | 17689.474 | 25757.576 |
| 409 | 18207.356 | 25393.21 | 19686.838 | 20541.5 | 23180.488 | 21581.155 | 20111.664 | 21909.051 | 20518.264 | 17483.165 | 18944.396 | 19559.952 | 17687.808 | 25757.576 |
| 410 | 18196.465 | 25378.441 | 19680.431 | 20541.5 | 23180.488 | 21581.155 | 20105.413 | 21909.051 | 20516.155 | 17481.343 | 18944.396 | 19559.952 | 17686.145 | 25757.576 |
| 411 | 18185.614 | 25363.689 | 19674.029 | 20541.5 | 23180.488 | 21581.155 | 20099.181 | 21899.476 | 20514.051 | 17480.128 | 18944.396 | 19552.09 | 17684.487 | 25757.576 |
| 412 | 18174.802 | 25348.954 | 19667.63 | 20541.5 | 23180.488 | 21581.155 | 20092.968 | 21899.476 | 20511.953 | 17478.913 | 18944.396 | 19552.09 | 17682.833 | 25757.576 |
| 413 | 18164.029 | 25334.237 | 19661.236 | 20541.5 | 23180.488 | 21581.155 | 20086.774 | 21899.476 | 20509.86 | 17477.092 | 18936.842 | 19552.09 | 17681.184 | 25757.576 |
| 414 | 18153.294 | 25319.536 | 19654.846 | 20541.5 | 23180.488 | 21581.155 | 20080.599 | 21899.476 | 20507.773 | 17475.878 | 18936.842 | 19552.09 | 17679.539 | 25757.576 |
| 415 | 18142.598 | 25304.852 | 19648.46 | 20541.5 | 23180.488 | 21581.155 | 20074.442 | 21889.908 | 20505.692 | 17474.057 | 18936.842 | 19552.09 | 17677.898 | 25757.576 |
| 416 | 18131.94 | 25290.185 | 19642.078 | 20541.5 | 23180.488 | 21581.155 | 20068.304 | 21889.908 | 20503.615 | 17472.843 | 18936.842 | 19544.235 | 17676.261 | 25757.576 |
| 417 | 18121.321 | 25275.536 | 19635.7 | 20541.5 | 23180.488 | 21581.155 | 20062.184 | 21889.908 | 20501.545 | 17471.023 | 18929.295 | 19544.235 | 17674.629 | 25757.576 |
| 418 | 18110.739 | 25260.903 | 19629.326 | 20541.5 | 23180.488 | 21581.155 | 20056.083 | 21889.908 | 20499.479 | 17469.204 | 18929.295 | 19544.235 | 17673 | 25757.576 |
| 419 | 18100.194 | 25246.287 | 19622.957 | 20541.5 | 23180.488 | 21581.155 | 20050 | 21880.349 | 20497.419 | 17467.991 | 18929.295 | 19544.235 | 17671.376 | 25757.576 |
| 420 | 18089.687 | 25231.689 | 19616.592 | 20541.5 | 23180.488 | 21581.155 | 20050 | 21880.349 | 20495.364 | 17466.171 | 18929.295 | 19544.235 | 17669.756 | 25757.576 |
| 421 | 18079.217 | 25217.107 | 19610.23 | 20541.5 | 23180.488 | 21581.155 | 20050 | 21880.349 | 20493.315 | 17464.353 | 18921.753 | 19536.386 | 17668.141 | 25757.576 |
| 422 | 18068.784 | 25202.541 | 19603.873 | 20541.5 | 23180.488 | 21581.155 | 20050 | 21880.349 | 20491.27 | 17463.14 | 18921.753 | 19536.386 | 17666.529 | 25757.576 |
| 423 | 18058.387 | 25187.993 | 19597.52 | 20541.5 | 23180.488 | 21581.155 | 20050 | 21880.349 | 20489.231 | 17461.322 | 18921.753 | 19536.386 | 17664.921 | 25757.576 |
| 424 | 18048.027 | 25173.462 | 19591.172 | 20541.5 | 23180.488 | 21581.155 | 20050 | 21870.799 | 20487.198 | 17460.11 | 18921.753 | 19536.386 | 17663.318 | 25757.576 |
| 425 | 18037.703 | 25158.947 | 19584.827 | 20541.5 | 23180.488 | 21581.155 | 20050 | 21870.799 | 20485.169 | 17458.899 | 18921.753 | 19528.543 | 17661.718 | 25757.576 |
| 426 | 18027.415 | 25144.449 | 19578.486 | 20541.5 | 23180.488 | 21581.155 | 20050 | 21870.799 | 20483.145 | 17456.476 | 18914.217 | 19528.543 | 17660.123 | 25757.576 |
| 427 | 18017.162 | 25129.967 | 19572.15 | 20541.5 | 23180.488 | 21581.155 | 20050 | 21870.799 | 20481.127 | 17455.265 | 18914.217 | 19528.543 | 17658.532 | 25757.576 |
| 428 | 18006.946 | 25115.503 | 19565.817 | 20541.5 | 23180.488 | 21581.155 | 20050 | 21870.799 | 20479.114 | 17454.053 | 18914.217 | 19528.543 | 17656.944 | 25757.576 |
| 429 | 17996.764 | 25101.055 | 19559.489 | 20541.5 | 23180.488 | 21581.155 | 20050 | 21870.799 | 20477.106 | 17452.237 | 18914.217 | 19528.543 | 17655.361 | 25757.576 |
| 430 | 17986.618 | 25086.623 | 19553.165 | 20541.5 | 23180.488 | 21581.155 | 20050 | 21861.257 | 20475.103 | 17450.421 | 18906.688 | 19520.706 | 17653.782 | 25757.576 |
| 431 | 17976.506 | 25072.208 | 19546.845 | 20541.5 | 23180.488 | 21581.155 | 20050 | 21861.257 | 20473.105 | 17449.211 | 18906.688 | 19520.706 | 17652.206 | 25757.576 |
| 432 | 17966.43 | 25057.81 | 19540.529 | 20541.5 | 23180.488 | 21581.155 | 20050 | 21861.257 | 20471.111 | 17448.001 | 18906.688 | 19520.706 | 17650.635 | 25757.576 |
| 433 | 17956.387 | 25043.428 | 19534.217 | 20541.5 | 23180.488 | 21581.155 | 20050 | 21861.257 | 20469.123 | 17446.791 | 18906.688 | 19520.706 | 17649.067 | 25757.576 |
| 434 | 17946.379 | 25029.063 | 19527.909 | 20541.5 | 23180.488 | 21581.155 | 20050 | 21861.257 | 20467.14 | 17444.976 | 18899.164 | 19520.706 | 17647.503 | 25757.576 |
| 435 | 17936.406 | 25014.714 | 19521.605 | 20541.5 | 23180.488 | 21581.155 | 20050 | 21861.257 | 20465.162 | 17443.162 | 18899.164 | 19512.876 | 17645.943 | 25757.576 |
| 436 | 17926.466 | 25000.382 | 19515.305 | 20541.5 | 23180.488 | 21581.155 | 20050 | 21861.257 | 20463.189 | 17441.952 | 18899.164 | 19512.876 | 17644.387 | 25757.576 |
| 437 | 17916.559 | 24986.066 | 19509.01 | 20541.5 | 23180.488 | 21581.155 | 20050 | 21851.723 | 20461.22 | 17440.743 | 18899.164 | 19512.876 | 17642.835 | 25757.576 |
| 438 | 17906.687 | 24971.767 | 19502.718 | 20541.5 | 23180.488 | 21581.155 | 20050 | 21851.723 | 20459.257 | 17439.534 | 18899.164 | 19512.876 | 17641.287 | 25757.576 |
| 439 | 17896.847 | 24957.483 | 19496.43 | 20541.5 | 23180.488 | 21581.155 | 20050 | 21851.723 | 20457.298 | 17437.117 | 18891.647 | 19512.876 | 17639.742 | 25757.576 |
| 440 | 17887.041 | 24943.216 | 19490.147 | 20541.5 | 23180.488 | 21581.155 | 20050 | 21851.723 | 20455.344 | 17435.908 | 18891.647 | 19505.052 | 17638.201 | 25757.576 |
| 441 | 17877.267 | 24928.966 | 19483.867 | 20541.5 | 23180.488 | 21581.155 | 20050 | 21851.723 | 20453.395 | 17434.7 | 18891.647 | 19505.052 | 17636.664 | 25757.576 |
| 442 | 17867.527 | 24914.732 | 19477.592 | 20541.5 | 23180.488 | 21581.155 | 20050 | 21851.723 | 20451.451 | 17432.888 | 18891.647 | 19505.052 | 17635.131 | 25757.576 |
| 443 | 17857.819 | 24900.514 | 19471.321 | 20541.5 | 23180.488 | 21581.155 | 20050 | 21851.723 | 20449.512 | 17431.076 | 18884.135 | 19505.052 | 17633.601 | 25757.576 |
| 444 | 17848.143 | 24886.312 | 19465.053 | 20541.5 | 23180.488 | 21581.155 | 20050 | 21851.723 | 20447.577 | 17429.868 | 18884.135 | 19505.052 | 17632.075 | 25757.576 |
| 445 | 17838.499 | 24872.126 | 19458.79 | 20541.5 | 23180.488 | 21581.155 | 20050 | 21851.723 | 20445.647 | 17428.661 | 18884.135 | 19497.234 | 17630.553 | 25757.576 |
| 446 | 17828.887 | 24857.957 | 19452.531 | 20541.5 | 23180.488 | 21581.155 | 20050 | 21851.723 | 20443.721 | 17426.85 | 18884.135 | 19497.234 | 17629.034 | 25757.576 |
| 447 | 17819.308 | 24843.803 | 19446.275 | 20541.5 | 23180.488 | 21581.155 | 20050 | 21851.723 | 20441.801 | 17425.039 | 18884.135 | 19497.234 | 17627.52 | 25757.576 |
| 448 | 17809.759 | 24829.666 | 19440.024 | 20541.5 | 23180.488 | 21581.155 | 20050 | 21842.197 | 20439.884 | 17423.832 | 18876.63 | 19497.234 | 17626.008 | 25757.576 |
| 449 | 17800.242 | 24815.545 | 19433.777 | 20541.5 | 23180.488 | 21581.155 | 20050 | 21842.197 | 20437.973 | 17422.625 | 18876.63 | 19497.234 | 17624.501 | 25757.576 |
| 450 | 17790.757 | 24801.44 | 19427.534 | 20541.5 | 23180.488 | 21581.155 | 20050 | 21842.197 | 20436.066 | 17421.419 | 18876.63 | 19489.423 | 17622.997 | 25757.576 |
| 451 | 17781.302 | 24787.351 | 19421.294 | 20541.5 | 23180.488 | 21581.155 | 20050 | 21842.197 | 20434.164 | 17419.609 | 18876.63 | 19489.423 | 17621.496 | 25757.576 |
| 452 | 17771.879 | 24773.278 | 19415.059 | 20541.5 | 23180.488 | 21581.155 | 20050 | 21842.197 | 20432.266 | 17418.403 | 18869.13 | 19489.423 | 17619.999 | 25757.576 |
| 453 | 17762.486 | 24759.221 | 19408.828 | 20541.5 | 23180.488 | 21581.155 | 20050 | 21842.197 | 20430.373 | 17417.197 | 18869.13 | 19489.423 | 17618.506 | 25757.576 |
| 454 | 17753.124 | 24745.18 | 19402.601 | 20541.5 | 23180.488 | 21581.155 | 20050 | 21842.197 | 20428.484 | 17415.992 | 18869.13 | 19489.423 | 17617.016 | 25757.576 |
| 455 | 17743.792 | 24731.154 | 19396.378 | 20541.5 | 23180.488 | 21581.155 | 20050 | 21842.197 | 20426.6 | 17414.786 | 18869.13 | 19481.618 | 17615.53 | 25757.576 |
| 456 | 17734.49 | 24717.145 | 19390.159 | 20541.5 | 23180.488 | 21581.155 | 20050 | 21842.197 | 20424.72 | 17412.375 | 18869.13 | 19481.618 | 17614.047 | 25757.576 |
| 457 | 17725.218 | 24703.152 | 19383.943 | 20541.5 | 23180.488 | 21581.155 | 20050 | 21842.197 | 20422.845 | 17411.17 | 18861.636 | 19481.618 | 17612.568 | 25757.576 |
| 458 | 17715.977 | 24689.174 | 19377.732 | 20541.5 | 23180.488 | 21581.155 | 20050 | 21842.197 | 20420.974 | 17409.965 | 18861.636 | 19481.618 | 17611.092 | 25757.576 |
| 459 | 17706.765 | 24675.212 | 19371.525 | 20541.5 | 23180.488 | 21581.155 | 20050 | 21842.197 | 20419.108 | 17408.761 | 18861.636 | 19481.618 | 17609.62 | 25757.576 |
| 460 | 17697.582 | 24661.266 | 19365.322 | 20541.5 | 23180.488 | 21581.155 | 20050 | 21842.197 | 20417.246 | 17407.556 | 18861.636 | 19473.819 | 17608.151 | 25757.576 |
| 461 | 17688.429 | 24647.336 | 19359.122 | 20541.5 | 23180.488 | 21581.155 | 20050 | 21842.197 | 20415.388 | 17405.147 | 18854.148 | 19473.819 | 17606.685 | 25757.576 |
| 462 | 17679.305 | 24633.421 | 19352.927 | 20541.5 | 23180.488 | 21581.155 | 20050 | 21842.197 | 20413.535 | 17403.943 | 18854.148 | 19473.819 | 17605.223 | 25757.576 |
| 463 | 17670.21 | 24619.522 | 19346.736 | 20541.5 | 23180.488 | 21581.155 | 20050 | 21842.197 | 20411.686 | 17402.739 | 18854.148 | 19473.819 | 17603.765 | 25757.576 |
| 464 | 17661.144 | 24605.639 | 19340.548 | 20541.5 | 23180.488 | 21581.155 | 20050 | 21842.197 | 20409.841 | 17401.536 | 18854.148 | 19473.819 | 17602.309 | 25757.576 |
| 465 | 17652.107 | 24591.772 | 19334.365 | 20541.5 | 23180.488 | 21581.155 | 20050 | 21842.197 | 20408.001 | 17400.332 | 18854.148 | 19466.026 | 17600.857 | 25757.576 |
| 466 | 17643.098 | 24577.92 | 19328.185 | 20541.5 | 23180.488 | 21581.155 | 20050 | 21842.197 | 20406.165 | 17398.527 | 18846.667 | 19466.026 | 17599.409 | 25757.576 |
| 467 | 17634.118 | 24564.083 | 19322.01 | 20541.5 | 23180.488 | 21581.155 | 20050 | 21842.197 | 20404.333 | 17397.324 | 18846.667 | 19466.026 | 17597.964 | 25757.576 |
| 468 | 17625.166 | 24550.263 | 19315.838 | 20541.5 | 23180.488 | 21581.155 | 20050 | 21842.197 | 20402.505 | 17395.519 | 18846.667 | 19466.026 | 17596.522 | 25757.576 |
| 469 | 17616.243 | 24536.457 | 19309.67 | 20541.5 | 23180.488 | 21581.155 | 20050 | 21842.197 | 20400.682 | 17394.317 | 18846.667 | 19466.026 | 17595.083 | 25757.576 |
| 470 | 17607.347 | 24522.668 | 19303.507 | 20541.5 | 23180.488 | 21581.155 | 20050 | 21842.197 | 20398.863 | 17394.317 | 18846.667 | 19458.24 | 17593.648 | 25757.576 |
| 471 | 17598.479 | 24508.893 | 19297.347 | 20541.5 | 23180.488 | 21581.155 | 20050 | 21842.197 | 20397.048 | 17394.317 | 18839.191 | 19458.24 | 17592.216 | 25757.576 |
| 472 | 17589.638 | 24495.135 | 19291.191 | 20541.5 | 23180.488 | 21581.155 | 20050 | 21842.197 | 20395.237 | 17394.317 | 18839.191 | 19458.24 | 17590.787 | 25757.576 |
| 473 | 17580.826 | 24481.391 | 19285.039 | 20541.5 | 23180.488 | 21581.155 | 20050 | 21842.197 | 20393.43 | 17394.317 | 18839.191 | 19458.24 | 17589.362 | 25757.576 |
| 474 | 17572.04 | 24467.664 | 19278.891 | 20541.5 | 23180.488 | 21581.155 | 20050 | 21842.197 | 20391.628 | 17394.317 | 18839.191 | 19458.24 | 17587.939 | 25757.576 |
| 475 | 17563.282 | 24453.951 | 19272.747 | 20541.5 | 23180.488 | 21581.155 | 20050 | 21842.197 | 20389.829 | 17394.317 | 18831.721 | 19450.46 | 17586.52 | 25757.576 |
| 476 | 17554.551 | 24440.254 | 19266.607 | 20541.5 | 23180.488 | 21581.155 | 20050 | 21842.197 | 20388.035 | 17394.317 | 18831.721 | 19450.46 | 17585.104 | 25757.576 |
| 477 | 17545.847 | 24426.572 | 19260.47 | 20541.5 | 23180.488 | 21581.155 | 20050 | 21842.197 | 20386.245 | 17394.317 | 18831.721 | 19450.46 | 17583.692 | 25757.576 |
| 478 | 17537.169 | 24412.906 | 19254.338 | 20541.5 | 23180.488 | 21581.155 | 20050 | 21842.197 | 20384.458 | 17394.317 | 18831.721 | 19450.46 | 17582.282 | 25757.576 |
| 479 | 17528.519 | 24399.254 | 19248.21 | 20541.5 | 23180.488 | 21581.155 | 20050 | 21842.197 | 20382.676 | 17394.317 | 18831.721 | 19450.46 | 17580.876 | 25757.576 |
| 480 | 17519.894 | 24385.618 | 19242.085 | 20541.5 | 23180.488 | 21581.155 | 20050 | 21842.197 | 20380.898 | 17394.317 | 18824.257 | 19450.46 | 17579.473 | 25757.576 |
| 481 | 17511.296 | 24371.998 | 19235.964 | 20541.5 | 23180.488 | 21581.155 | 20050 | 21842.197 | 20379.124 | 17394.317 | 18824.257 | 19442.686 | 17578.073 | 25757.576 |
| 482 | 17502.725 | 24358.392 | 19229.848 | 20541.5 | 23180.488 | 21581.155 | 20050 | 21842.197 | 20377.354 | 17394.317 | 18824.257 | 19442.686 | 17576.676 | 25757.576 |
| 483 | 17494.179 | 24344.802 | 19223.735 | 20541.5 | 23180.488 | 21581.155 | 20050 | 21842.197 | 20375.588 | 17394.317 | 18824.257 | 19442.686 | 17575.282 | 25757.576 |
| 484 | 17485.66 | 24331.227 | 19217.626 | 20541.5 | 23180.488 | 21581.155 | 20050 | 21842.197 | 20373.825 | 17394.317 | 18824.257 | 19442.686 | 17573.891 | 25757.576 |
| 485 | 17477.166 | 24317.667 | 19211.521 | 20541.5 | 23180.488 | 21581.155 | 20050 | 21842.197 | 20372.067 | 17394.317 | 18816.799 | 19442.686 | 17572.504 | 25757.576 |
| 486 | 17468.698 | 24304.122 | 19205.419 | 20541.5 | 23180.488 | 21581.155 | 20050 | 21842.197 | 20370.313 | 17394.317 | 18816.799 | 19434.918 | 17571.119 | 25757.576 |
| 487 | 17460.255 | 24290.592 | 19199.322 | 20541.5 | 23180.488 | 21581.155 | 20050 | 21842.197 | 20368.562 | 17394.317 | 18816.799 | 19434.918 | 17569.738 | 25757.576 |
| 488 | 17451.838 | 24277.077 | 19193.228 | 20541.5 | 23180.488 | 21581.155 | 20050 | 21842.197 | 20366.815 | 17394.317 | 18816.799 | 19434.918 | 17568.359 | 25757.576 |
| 489 | 17443.446 | 24263.577 | 19187.139 | 20541.5 | 23180.488 | 21581.155 | 20050 | 21842.197 | 20365.073 | 17394.317 | 18816.799 | 19434.918 | 17566.984 | 25757.576 |
| 490 | 17435.079 | 24250.093 | 19181.053 | 20541.5 | 23180.488 | 21581.155 | 20050 | 21842.197 | 20363.334 | 17394.317 | 18809.347 | 19434.918 | 17565.612 | 25757.576 |
| 491 | 17426.738 | 24236.623 | 19174.971 | 20541.5 | 23180.488 | 21581.155 | 20050 | 21842.197 | 20361.599 | 17394.317 | 18809.347 | 19434.918 | 17564.242 | 25757.576 |
| 492 | 17418.421 | 24223.168 | 19168.893 | 20541.5 | 23180.488 | 21581.155 | 20050 | 21842.197 | 20359.867 | 17394.317 | 18809.347 | 19427.157 | 17562.876 | 25757.576 |
| 493 | 17410.129 | 24209.728 | 19162.819 | 20541.5 | 23180.488 | 21581.155 | 20050 | 21842.197 | 20358.14 | 17394.317 | 18809.347 | 19427.157 | 17561.512 | 25757.576 |
| 494 | 17401.861 | 24196.303 | 19156.749 | 20541.5 | 23180.488 | 21581.155 | 20050 | 21842.197 | 20356.416 | 17394.317 | 18809.347 | 19427.157 | 17560.152 | 25757.576 |
| 495 | 17393.618 | 24182.893 | 19150.682 | 20541.5 | 23180.488 | 21581.155 | 20050 | 21842.197 | 20354.696 | 17394.317 | 18801.9 | 19427.157 | 17558.794 | 25757.576 |
| 496 | 17385.4 | 24169.498 | 19144.619 | 20541.5 | 23180.488 | 21581.155 | 20050 | 21842.197 | 20352.98 | 17394.317 | 18801.9 | 19427.157 | 17557.44 | 25757.576 |
| 497 | 17377.206 | 24156.117 | 19138.561 | 20541.5 | 23180.488 | 21581.155 | 20050 | 21842.197 | 20351.268 | 17394.317 | 18801.9 | 19419.401 | 17556.088 | 25757.576 |
| 498 | 17369.036 | 24142.752 | 19132.506 | 20541.5 | 23180.488 | 21581.155 | 20050 | 21842.197 | 20349.559 | 17394.317 | 18801.9 | 19419.401 | 17554.74 | 25757.576 |
| 499 | 17360.889 | 24129.401 | 19126.454 | 20541.5 | 23180.488 | 21581.155 | 20050 | 21842.197 | 20347.854 | 17394.317 | 18801.9 | 19419.401 | 17553.394 | 25757.576 |